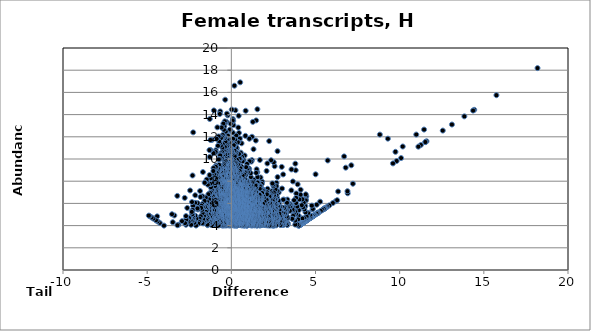
| Category | Series 0 |
|---|---|
| 18.1895096491 | 18.19 |
| 15.7480484156 | 15.748 |
| 14.4288894389 | 14.429 |
| 14.3620040675 | 14.362 |
| 13.8424839201 | 13.842 |
| 12.5608844879 | 12.561 |
| 11.5948890669 | 11.595 |
| 11.5217721789 | 11.522 |
| 11.2599491802 | 11.26 |
| 11.110137439155412 | 11.11 |
| 10.1830408554 | 11.125 |
| 10.0852599896 | 10.085 |
| 9.82118403024 | 9.821 |
| 9.60182648984 | 9.602 |
| 9.3 | 11.831 |
| 8.82317337223 | 12.198 |
| 7.22241447803 | 7.771 |
| 7.12714503846 | 9.434 |
| 6.91288933623 | 6.913 |
| 6.9 | 7.099 |
| 6.7946840774 | 9.219 |
| 6.7 | 10.234 |
| 6.20045727143 | 6.2 |
| 5.72578515184 | 9.868 |
| 13.1051408089 | 13.105 |
| 3.82477850622 | 8.984 |
| 3.07943135834 | 8.61 |
| 2.39657568487 | 7.101 |
| 6.28835856219 | 6.288 |
| 5.57712666131 | 5.577 |
| 4.82387000884 | 5.445 |
| 11.5292597243 | 11.529 |
| 10.987380413 | 12.202 |
| 6.34534475932 | 7.075 |
| 4.52418907845 | 4.524 |
| 11.4498932668 | 12.652 |
| 9.75013065383 | 10.646 |
| 6.03033607837 | 6.03 |
| 5.82273014794 | 5.823 |
| 5.69460165336 | 5.695 |
| 5.61676936629 | 5.617 |
| 5.56529252058 | 5.565 |
| 5.55979769575 | 5.56 |
| 5.53543091487 | 5.535 |
| 5.5131748846 | 5.513 |
| 5.49185309633 | 5.492 |
| 5.40871186103 | 5.409 |
| 5.3165078191 | 5.317 |
| 5.27356507333 | 6.154 |
| 5.18269229752 | 5.183 |
| 5.15299460549 | 5.153 |
| 5.13463167145 | 5.135 |
| 5.12928301694 | 5.129 |
| 5.11561593143 | 5.116 |
| 5.11519974939 | 5.115 |
| 5.10517519227 | 5.105 |
| 5.07242307461 | 5.881 |
| 5.05874941234 | 5.059 |
| 5.00686729419 | 8.623 |
| 4.96670731415 | 4.967 |
| 4.93687346182 | 4.937 |
| 4.93215568443 | 4.932 |
| 4.90640961709 | 4.906 |
| 4.85499301676 | 4.855 |
| 4.85199883711 | 4.852 |
| 4.84291438404 | 5.502 |
| 4.83844759255 | 4.838 |
| 4.78096421984 | 5.8 |
| 4.77452352959 | 4.775 |
| 4.76288029292 | 4.763 |
| 4.76288029292 | 4.763 |
| 4.76288029292 | 4.763 |
| 4.73930807086 | 4.739 |
| 4.72955277045 | 4.73 |
| 4.72137265948 | 4.721 |
| 4.71644223684 | 4.716 |
| 4.71314590249 | 4.713 |
| 4.70984201927 | 4.71 |
| 4.70984201927 | 4.71 |
| 4.70984201927 | 4.71 |
| 4.6999528968 | 4.896 |
| 4.68408354716 | 4.906 |
| 4.65649637055 | 4.656 |
| 4.59514556799 | 4.595 |
| 4.57106999817 | 4.571 |
| 4.5640979808 | 5.149 |
| 4.56240034607 | 5.117 |
| 4.55151601763 | 4.552 |
| 4.5210507369 | 4.521 |
| 4.51790555353 | 4.518 |
| 4.496973581 | 4.497 |
| 4.48864353985 | 4.489 |
| 4.47031993478 | 4.817 |
| 4.45811948117 | 4.458 |
| 4.45493303364 | 6.636 |
| 4.43829285158 | 4.438 |
| 4.43696133783 | 4.437 |
| 4.43362716708 | 4.434 |
| 4.4316303468 | 6.335 |
| 4.42558384815 | 6.259 |
| 4.42102738442 | 6.816 |
| 4.40352287749 | 5.206 |
| 4.39835037035 | 5.761 |
| 4.3840498068 | 4.384 |
| 4.36876834909 | 4.369 |
| 4.36527259976 | 4.365 |
| 4.3645724323 | 4.365 |
| 4.33976638051 | 5.468 |
| 4.33697438893 | 4.661 |
| 4.33270793364 | 4.333 |
| 4.32984117653 | 4.33 |
| 4.31179371775 | 4.312 |
| 4.2982750148 | 6.067 |
| 4.29498826769 | 4.295 |
| 4.28688114779 | 4.287 |
| 4.28392177231 | 4.284 |
| 4.26753579807 | 4.268 |
| 4.26545816008 | 5.655 |
| 4.24564777364 | 4.246 |
| 4.24031432933 | 4.24 |
| 4.23342794375 | 4.233 |
| 4.21800615028 | 4.218 |
| 4.21617922882 | 6.372 |
| 4.21559685983 | 4.646 |
| 4.20711196121 | 4.207 |
| 4.20711196121 | 4.207 |
| 4.19298316997 | 4.193 |
| 4.19219416528 | 4.192 |
| 4.18357009081 | 5.84 |
| 4.18269229752 | 4.183 |
| 4.15866017535 | 4.159 |
| 4.13504228623 | 4.135 |
| 4.1191178349 | 7.229 |
| 4.11686375769 | 4.117 |
| 4.11603199345 | 4.116 |
| 4.11135090598 | 6.779 |
| 4.10097764772 | 4.101 |
| 4.10013667129 | 4.1 |
| 4.09592442 | 4.096 |
| 4.09339115325 | 4.093 |
| 4.08576455378 | 4.086 |
| 4.08491465977 | 4.085 |
| 4.07124781946 | 4.071 |
| 4.06177619759 | 4.062 |
| 4.05745027218 | 4.057 |
| 4.03913839391 | 4.039 |
| 4.03356123265 | 6.359 |
| 4.02236781303 | 4.022 |
| 4.02059109477 | 4.021 |
| 4.00611846138 | 5.381 |
| 4.00090140274 | 4.001 |
| 4.00050084883 | 4.888 |
| 3.99909803371 | 3.999 |
| 3.98447353656 | 4.881 |
| 3.96172343202 | 4.557 |
| 3.94119050751 | 7.719 |
| 3.92056553251 | 4.094 |
| 3.90861734033 | 5.714 |
| 3.85778791065 | 6.892 |
| 3.85115480593 | 6.034 |
| 3.84914530714 | 6.498 |
| 3.84099859264 | 5.039 |
| 3.8029000096 | 9.579 |
| 3.79881318579 | 4.092 |
| 3.7981657506 | 5.295 |
| 3.78457152641 | 4.454 |
| 3.72683908451 | 6.283 |
| 3.71712917851 | 5.03 |
| 3.69434103551 | 5.4 |
| 3.67217047137 | 4.884 |
| 3.66069353935 | 4.592 |
| 3.65733479638 | 7.977 |
| 3.63974928774 | 5.702 |
| 3.63093592515 | 5.441 |
| 3.61211410698 | 4.616 |
| 3.57293936597 | 9.061 |
| 3.56478461878 | 7.175 |
| 3.55579348917 | 5.762 |
| 3.51535703324 | 5.884 |
| 3.48239276708 | 5.723 |
| 3.47410191137 | 5.32 |
| 3.46841418336 | 5.96 |
| 3.40403156387 | 5.872 |
| 3.35962038496 | 4.182 |
| 3.35679670643 | 4.655 |
| 3.35391820913 | 5.616 |
| 3.34794442 | 6.071 |
| 3.34422313458 | 4.713 |
| 3.33197637314 | 6.346 |
| 3.32729460464 | 4.068 |
| 3.32444808687 | 5.955 |
| 3.31478602564 | 4.065 |
| 3.31103977874 | 5.412 |
| 3.30536532135 | 6.06 |
| 3.29633638098 | 4.835 |
| 3.26894244229 | 5.092 |
| 3.26140883378 | 4.216 |
| 3.23169656193 | 5.393 |
| 3.21586437834 | 5.479 |
| 3.19662528885 | 5.091 |
| 3.19296105423 | 4.372 |
| 3.19183495436 | 5.638 |
| 3.17491371117 | 5.352 |
| 3.17434638106 | 5.142 |
| 3.16914663884 | 4.292 |
| 3.1680759848 | 5.073 |
| 3.13410003324 | 4.82 |
| 3.13320338632 | 5.593 |
| 3.13016393256 | 6.342 |
| 3.1270651917 | 4.097 |
| 3.12485982991 | 4.377 |
| 3.1230583964 | 4.341 |
| 3.10832531328 | 4.264 |
| 3.08203576887 | 4.914 |
| 3.08037341646 | 6.335 |
| 3.06873517708 | 4.05 |
| 3.06563097383 | 5.098 |
| 3.06278760516 | 4.305 |
| 3.04778377135 | 4.271 |
| 3.035448836 | 4.128 |
| 3.03129053208 | 5.636 |
| 3.01447849511 | 7.341 |
| 3.00547282231 | 4.685 |
| 2.99516144306 | 4.865 |
| 2.99490784097 | 9.29 |
| 2.994401247 | 4.947 |
| 2.98114097275 | 4.289 |
| 2.97202662055 | 4.884 |
| 2.95772656102 | 4.739 |
| 2.94217934561 | 4.108 |
| 2.94135006635 | 5.475 |
| 2.94032482334 | 4.775 |
| 2.93501065985 | 4.101 |
| 2.93211542177 | 5.229 |
| 2.92803640448 | 4.624 |
| 2.9201629527 | 5.503 |
| 2.91857240066 | 4.049 |
| 2.91030930584 | 5.551 |
| 2.90983187092 | 5.617 |
| 2.90661016116 | 4.815 |
| 2.88505939967 | 4.884 |
| 2.88434802696 | 4.367 |
| 2.8831173577 | 5.539 |
| 2.88086780446 | 5.702 |
| 2.85987852932 | 5.402 |
| 2.84932894718 | 5.068 |
| 2.82635447288 | 6.029 |
| 2.82225078211 | 4.161 |
| 2.8135751205 | 6.982 |
| 2.79444334442 | 6.211 |
| 2.79377651556 | 5.707 |
| 2.79041841605 | 6.24 |
| 2.78788341548 | 4.698 |
| 2.78749953817 | 4.621 |
| 2.77560244277 | 4.568 |
| 2.76517047543 | 5.742 |
| 2.74781109458 | 8.372 |
| 2.74438060834 | 10.704 |
| 2.7401485961 | 7.11 |
| 2.72409098621 | 4.122 |
| 2.7201343402 | 4.537 |
| 2.71678771223 | 4.788 |
| 2.71166970462 | 6.557 |
| 2.70968301653 | 4.754 |
| 2.70242008227 | 4.599 |
| 2.69932581122 | 4.42 |
| 2.69592808818 | 4.268 |
| 2.69295554932 | 5.013 |
| 2.686416652 | 4.575 |
| 2.6835633904 | 7.85 |
| 2.68353099946 | 6.746 |
| 2.68346483338 | 7.554 |
| 2.67963125586 | 5.932 |
| 2.67370909821 | 5.963 |
| 2.67311964635 | 5.462 |
| 2.6716465592 | 4.961 |
| 2.66883505798 | 4.315 |
| 2.66445309438 | 4.424 |
| 2.66361464544 | 5.883 |
| 2.65748498922 | 4.022 |
| 2.65469321411 | 4.449 |
| 2.65213421916 | 6.359 |
| 2.65207669658 | 5.584 |
| 2.64144532091 | 5.281 |
| 2.6370917109 | 5.895 |
| 2.62923813816 | 5.103 |
| 2.62036942256 | 7.027 |
| 2.61967563501 | 5.522 |
| 2.619206162 | 7.254 |
| 2.60873066665 | 4.348 |
| 2.60717723454 | 4.291 |
| 2.60634882536 | 5.269 |
| 2.60366222493 | 6.313 |
| 2.58547237704 | 6.023 |
| 2.58496250072 | 4.849 |
| 2.58250684899 | 5.326 |
| 2.57386242 | 9.349 |
| 2.57346686188 | 6.361 |
| 2.57325700007 | 4.455 |
| 2.56826378857 | 5.838 |
| 2.56159450999 | 6.654 |
| 2.55896729219 | 4.805 |
| 2.54432051622 | 4.091 |
| 2.54055429248 | 6.756 |
| 2.53605290024 | 4 |
| 2.5358745806 | 5.207 |
| 2.53114512748 | 5.451 |
| 2.53090076633 | 5.049 |
| 2.52375494583 | 4.388 |
| 2.52234857057 | 9.708 |
| 2.5220993832 | 6.981 |
| 2.51872880232 | 4.845 |
| 2.5092528409 | 4.38 |
| 2.50238118585 | 7.562 |
| 2.5016206484 | 4.628 |
| 2.49962514337 | 4.367 |
| 2.49765748865 | 7.7 |
| 2.49463822276 | 4.55 |
| 2.49322465734 | 5.647 |
| 2.49240894108 | 4.455 |
| 2.49116593507 | 6.193 |
| 2.48422341125 | 3.995 |
| 2.48224150155 | 5.003 |
| 2.47612096114 | 5.513 |
| 2.47480630375 | 5.787 |
| 2.47072654865 | 6.401 |
| 2.45986440551 | 4.225 |
| 2.45433570826 | 5.226 |
| 2.45069100306 | 6.246 |
| 2.44091026648 | 7.801 |
| 2.43773654754 | 4.018 |
| 2.42617622679 | 4.534 |
| 2.42288095425 | 5.666 |
| 2.4213703871 | 4.655 |
| 2.41956548522 | 5.986 |
| 2.41778113568 | 5.189 |
| 2.41769166546 | 5.154 |
| 2.41596869084 | 4.891 |
| 2.4159042431 | 4.664 |
| 2.41322182204 | 5.317 |
| 2.41160931143 | 5.881 |
| 2.41071157388 | 5.693 |
| 2.39490212644 | 6.891 |
| 2.39001971503 | 5.572 |
| 2.38796277099 | 4.835 |
| 2.38766106035 | 4.577 |
| 2.38551625501 | 4.261 |
| 2.38282093531 | 5.78 |
| 2.37700746261 | 4.594 |
| 2.36406029799 | 9.888 |
| 2.36291236391 | 6.74 |
| 2.36188370274 | 4.082 |
| 2.36110592878 | 4.382 |
| 2.35602129356 | 4.428 |
| 2.3541909637 | 4.027 |
| 2.34775708474 | 4.16 |
| 2.34686331831 | 6.617 |
| 2.33019275073 | 6.048 |
| 2.32875357012 | 5.844 |
| 2.32655825109 | 6.411 |
| 2.32524082893 | 4.316 |
| 2.31962408315 | 4.428 |
| 2.31869583061 | 6.654 |
| 2.31463883439 | 5.461 |
| 2.31395608835 | 5.164 |
| 2.31065002644 | 4.812 |
| 2.30794779339 | 4.776 |
| 2.29988694212 | 5.704 |
| 2.29422045525 | 6.032 |
| 2.29130534278 | 4.567 |
| 2.2907433897 | 4.149 |
| 2.29057959163 | 6.561 |
| 2.28645558449 | 5.256 |
| 2.28575448233 | 4.566 |
| 2.28540221886 | 4.74 |
| 2.28448172177 | 5.53 |
| 2.27877714238 | 4.143 |
| 2.2631213964 | 5.288 |
| 2.26282992776 | 4.005 |
| 2.25856290999 | 4.379 |
| 2.25804834862 | 6.628 |
| 2.25750482777 | 4.479 |
| 2.25607802088 | 5.171 |
| 2.24869082608 | 11.611 |
| 2.2485309748 | 5.137 |
| 2.2464378953 | 4.665 |
| 2.2373427628 | 5.327 |
| 2.23067903252 | 4.335 |
| 2.22808430766 | 4.847 |
| 2.22395589485 | 4.852 |
| 2.22226550732 | 5.492 |
| 2.21949910512 | 5.504 |
| 2.21222897641 | 5.487 |
| 2.20952679457 | 4.851 |
| 2.20929676372 | 4.755 |
| 2.19149482062 | 5.339 |
| 2.16857731798 | 4.219 |
| 2.16264447683 | 5.602 |
| 2.16223806369 | 5.626 |
| 2.16047953729 | 6.106 |
| 2.15805566657 | 5.901 |
| 2.1580155326 | 6.142 |
| 2.15699969938 | 7.318 |
| 2.14347145982 | 4.021 |
| 2.13996062648 | 9.6 |
| 2.13783116698 | 6.417 |
| 2.13540911974 | 4.606 |
| 2.13488907258 | 4.628 |
| 2.13481220669 | 5.534 |
| 2.13144396583 | 6.06 |
| 2.1217884804 | 6.351 |
| 2.11425717926 | 5.24 |
| 2.11047369837 | 7.011 |
| 2.10986300414 | 6.817 |
| 2.10839974787 | 4.685 |
| 2.10345604292 | 4.102 |
| 2.10061999907 | 5.592 |
| 2.09779681995 | 6.311 |
| 2.09392542083 | 8.922 |
| 2.0897818819 | 5.433 |
| 2.08274043101 | 5.694 |
| 2.08203576887 | 5.731 |
| 2.08029993142 | 5.104 |
| 2.07850197368 | 4.512 |
| 2.07663845971 | 4.161 |
| 2.07222832756 | 5.84 |
| 2.06343610821 | 5.188 |
| 2.05974208369 | 5.094 |
| 2.05640792189 | 4.276 |
| 2.0464039599 | 4.336 |
| 2.04106265662 | 5.247 |
| 2.03963303625 | 5.213 |
| 2.03372061784 | 5.89 |
| 2.02574541284 | 5.155 |
| 2.0218343706 | 4.721 |
| 2.02160225449 | 5.99 |
| 2.02069899267 | 4.044 |
| 2.0168187384 | 4.695 |
| 2.01581175258 | 5.287 |
| 2.0071955014 | 4.051 |
| 2.00203244228 | 4.68 |
| 1.99829165754 | 5.365 |
| 1.98568540307 | 5.095 |
| 1.97800903608 | 4.908 |
| 1.97695401459 | 5.216 |
| 1.97198562383 | 6.076 |
| 1.97133296829 | 6.161 |
| 1.96680030688 | 5.62 |
| 1.96400574114 | 4.515 |
| 1.96232958203 | 5.011 |
| 1.95751666868 | 4.992 |
| 1.95479029724 | 4.454 |
| 1.94958837435 | 5.515 |
| 1.94827280333 | 4.325 |
| 1.94329289503 | 4.435 |
| 1.93688995615 | 4.574 |
| 1.93614953746 | 4.232 |
| 1.93548203931 | 4.279 |
| 1.93358047369 | 6.522 |
| 1.92518051969 | 4.07 |
| 1.92114457929 | 4.426 |
| 1.9158915704 | 4.485 |
| 1.90698216332 | 7.216 |
| 1.901768163 | 4.146 |
| 1.89939084267 | 7.174 |
| 1.89500685211 | 4.713 |
| 1.88911031972 | 5.024 |
| 1.88623925517 | 4.348 |
| 1.88461739484 | 5.45 |
| 1.8840807127 | 5.22 |
| 1.87997172537 | 5.965 |
| 1.87943537081 | 4.708 |
| 1.87581022426 | 4.109 |
| 1.87560175392 | 6.743 |
| 1.87190523766 | 5.121 |
| 1.86782244357 | 4.575 |
| 1.86480226098 | 4.216 |
| 1.86236386951 | 5.628 |
| 1.85473289985 | 5.643 |
| 1.85014443251 | 7.18 |
| 1.84283908645 | 6.92 |
| 1.84249393088 | 4.093 |
| 1.84112658335 | 4.659 |
| 1.83953532781 | 6.455 |
| 1.83889911481 | 5.534 |
| 1.83806778931 | 4.132 |
| 1.8308581347 | 6.934 |
| 1.83052898903 | 7.953 |
| 1.82623708988 | 4.933 |
| 1.82208018427 | 5.63 |
| 1.81991838352 | 4.067 |
| 1.81776960988 | 5.079 |
| 1.81440554229 | 4.997 |
| 1.81438390084 | 4.332 |
| 1.81392757598 | 4.841 |
| 1.81217165371 | 7.76 |
| 1.81206704941 | 4.501 |
| 1.80753554116 | 5.654 |
| 1.8050681962 | 4.268 |
| 1.79093934207 | 5.366 |
| 1.78700627667 | 4.101 |
| 1.77377388089 | 7.395 |
| 1.76544906546 | 6.429 |
| 1.76297159998 | 6.698 |
| 1.7544836687 | 5.076 |
| 1.74942689785 | 6.5 |
| 1.74644664718 | 4.51 |
| 1.7442634664 | 4.725 |
| 1.74374807938 | 6.292 |
| 1.74222611063 | 4.784 |
| 1.73328635334 | 8.337 |
| 1.7324114234 | 7.578 |
| 1.73194568144 | 4.501 |
| 1.7301764285 | 4.733 |
| 1.72724199039 | 5.278 |
| 1.7257411565 | 4.021 |
| 1.725618871 | 5.783 |
| 1.72370669679 | 4.716 |
| 1.72333625374 | 5.244 |
| 1.72300900342 | 5.766 |
| 1.72169883751 | 5.657 |
| 1.72039912578 | 4.988 |
| 1.71749977158 | 5.187 |
| 1.71049338281 | 5.037 |
| 1.70837099178 | 5.237 |
| 1.70565420759 | 6.786 |
| 1.70303719637 | 6.518 |
| 1.70209513432 | 6.192 |
| 1.70068147684 | 5.846 |
| 1.69634386499 | 4.023 |
| 1.69570321177 | 9.911 |
| 1.69496177872 | 5.969 |
| 1.69377739195 | 7.531 |
| 1.69135184531 | 4.577 |
| 1.68994896766 | 4.328 |
| 1.68915238558 | 7.322 |
| 1.68906093026 | 6.255 |
| 1.68825378571 | 4.339 |
| 1.68669858881 | 6.367 |
| 1.68481142909 | 4.637 |
| 1.68474862042 | 5.398 |
| 1.68265284165 | 6.231 |
| 1.67855530101 | 4.923 |
| 1.67753668157 | 5.797 |
| 1.67523841534 | 6.762 |
| 1.67316077983 | 4.064 |
| 1.67117512364 | 4.919 |
| 1.66842522301 | 4.807 |
| 1.66806200888 | 4.191 |
| 1.66074155771 | 4.535 |
| 1.65585211206 | 6.464 |
| 1.65551578055 | 5.078 |
| 1.65380538864 | 5.713 |
| 1.6534879521 | 4.029 |
| 1.65119619912 | 5.399 |
| 1.64994702417 | 5.063 |
| 1.64760843428 | 5.794 |
| 1.6469782457 | 6.19 |
| 1.63372832772 | 5.154 |
| 1.62836928824 | 6.343 |
| 1.61705800284 | 5.947 |
| 1.6163096338 | 4.566 |
| 1.61526110125 | 4.372 |
| 1.61223543087 | 4.341 |
| 1.61048629852 | 4.872 |
| 1.61022541189 | 4.052 |
| 1.60868541151 | 5.928 |
| 1.6042706047 | 6.247 |
| 1.60275181416 | 6.002 |
| 1.59828889247 | 7.867 |
| 1.59511296132 | 5.132 |
| 1.59265853434 | 5.944 |
| 1.59002637058 | 5.21 |
| 1.59000513095 | 4.177 |
| 1.58993731614 | 4.474 |
| 1.58370961741 | 5.493 |
| 1.58299831384 | 4.216 |
| 1.580623565 | 4.677 |
| 1.57548522242 | 4.412 |
| 1.57531233069 | 5.35 |
| 1.57092336009 | 4.642 |
| 1.56471281612 | 6.049 |
| 1.56117624786 | 5.95 |
| 1.56104387381 | 4.668 |
| 1.55937078682 | 4.084 |
| 1.55890527946 | 5.246 |
| 1.55809724707 | 5.693 |
| 1.5546470965 | 8.371 |
| 1.55424936549 | 4.58 |
| 1.55191253465 | 6.06 |
| 1.55066815856 | 5.775 |
| 1.54896589247 | 7.882 |
| 1.54717796251 | 14.483 |
| 1.54468850374 | 6.439 |
| 1.54423049014 | 8.805 |
| 1.54195350168 | 5.216 |
| 1.53997504595 | 4.508 |
| 1.53995849125 | 5.499 |
| 1.53605290024 | 5.375 |
| 1.53153846576 | 4.472 |
| 1.52904039615 | 6.464 |
| 1.52664354151 | 4.165 |
| 1.52484150828 | 4.009 |
| 1.52227543079 | 5.044 |
| 1.51925034918 | 5.683 |
| 1.51905047924 | 5.132 |
| 1.51381098471 | 6.241 |
| 1.51068431048 | 5.233 |
| 1.50948843515 | 4.778 |
| 1.50918967177 | 4.004 |
| 1.50809883867 | 4.09 |
| 1.50528580304 | 5.185 |
| 1.50500801315 | 5.341 |
| 1.50391878037 | 4.455 |
| 1.50353670625 | 6.021 |
| 1.50321919774 | 9.07 |
| 1.5020361636 | 6.602 |
| 1.50139778408 | 4.833 |
| 1.49776144884 | 5.423 |
| 1.49629811444 | 6.238 |
| 1.49525969777 | 4.969 |
| 1.49325875593 | 7.674 |
| 1.4894441877 | 4.606 |
| 1.48872326331 | 7.033 |
| 1.48871773098 | 5.388 |
| 1.48723664231 | 7.481 |
| 1.48542682717 | 5.18 |
| 1.48373093531 | 5.826 |
| 1.48330417592 | 4.401 |
| 1.48263665095 | 5.456 |
| 1.48219373109 | 6.035 |
| 1.48181707956 | 5.674 |
| 1.48082005704 | 7.103 |
| 1.47684038733 | 6.771 |
| 1.47676516295 | 6.318 |
| 1.4756837452 | 8.751 |
| 1.47482658844 | 13.479 |
| 1.47313812523 | 5.228 |
| 1.4718723407 | 5.99 |
| 1.47088163938 | 5.204 |
| 1.4694254331 | 6.968 |
| 1.46642741949 | 6.618 |
| 1.46332639423 | 7.643 |
| 1.46133696113 | 5.587 |
| 1.45988932646 | 7.417 |
| 1.45630551765 | 6.444 |
| 1.45462612767 | 6.162 |
| 1.4542203255 | 7.044 |
| 1.45350109533 | 11.664 |
| 1.45335119611 | 4.323 |
| 1.45222081329 | 4.955 |
| 1.44599920245 | 4.892 |
| 1.44557277008 | 6.265 |
| 1.44387997479 | 5.191 |
| 1.44249903906 | 4.664 |
| 1.4424188868 | 4.886 |
| 1.44151340512 | 6.021 |
| 1.43977644599 | 4.063 |
| 1.43655606153 | 4.274 |
| 1.4355177677 | 7.621 |
| 1.43368456187 | 5.318 |
| 1.43046036795 | 4.23 |
| 1.43012491391 | 4.957 |
| 1.42765049589 | 4.076 |
| 1.42331373864 | 4.667 |
| 1.42307196129 | 5.238 |
| 1.41547514377 | 5.47 |
| 1.4154032478 | 4.094 |
| 1.41361120649 | 5.771 |
| 1.40103982385 | 4.039 |
| 1.39894181309 | 4.124 |
| 1.3932050834 | 7.234 |
| 1.39131311014 | 5.075 |
| 1.389912468 | 5.299 |
| 1.38389625509 | 6.266 |
| 1.38070750654 | 4.614 |
| 1.37885457317 | 6.698 |
| 1.37736708131 | 4.04 |
| 1.37618657031 | 4.415 |
| 1.37401660604 | 4.213 |
| 1.37270469122 | 6.181 |
| 1.37163071176 | 4.036 |
| 1.36769007143 | 6.522 |
| 1.36713098143 | 5.566 |
| 1.36650892727 | 5.23 |
| 1.36598070755 | 4.869 |
| 1.36506209562 | 6.662 |
| 1.35946015138 | 5.76 |
| 1.3586866449 | 4.543 |
| 1.35810672451 | 5.39 |
| 1.35791224309 | 4.922 |
| 1.35771565898 | 6.507 |
| 1.35592202474 | 6.931 |
| 1.35499284562 | 5.327 |
| 1.35301438546 | 7.153 |
| 1.35284625526 | 6.691 |
| 1.35045924192 | 6.29 |
| 1.34891945771 | 4.916 |
| 1.34663848579 | 6.348 |
| 1.34471257598 | 6.096 |
| 1.34333765401 | 4.59 |
| 1.34225269655 | 5.503 |
| 1.34096052616 | 4.05 |
| 1.33390961449 | 6.548 |
| 1.33309877536 | 5.809 |
| 1.33297732077 | 6 |
| 1.33189709186 | 5.998 |
| 1.32926260505 | 5.064 |
| 1.32608657637 | 5.045 |
| 1.32473720766 | 8.127 |
| 1.32156296348 | 6.357 |
| 1.31901093623 | 10.88 |
| 1.31672808593 | 6.022 |
| 1.31531959912 | 4.957 |
| 1.31529500255 | 5.48 |
| 1.31495542113 | 6.269 |
| 1.31479281858 | 6.18 |
| 1.31309593378 | 4.842 |
| 1.31108311094 | 4.936 |
| 1.30875270614 | 5.537 |
| 1.30825315799 | 4.4 |
| 1.30776670944 | 7.925 |
| 1.30385117827 | 5.953 |
| 1.30347533186 | 4.912 |
| 1.30256277002 | 6.45 |
| 1.30205107234 | 6.189 |
| 1.30109582441 | 4.832 |
| 1.30103287058 | 6.853 |
| 1.29829798712 | 6.649 |
| 1.29454821857 | 7.164 |
| 1.29301211234 | 6.771 |
| 1.28182737146 | 6.264 |
| 1.28177096842 | 4.658 |
| 1.28097244694 | 5.629 |
| 1.28034583718 | 5.157 |
| 1.27991940307 | 6.251 |
| 1.27847788669 | 13.345 |
| 1.2751654853 | 4.292 |
| 1.27452522566 | 4.271 |
| 1.27273090444 | 4.064 |
| 1.27018451979 | 4.596 |
| 1.26574369309 | 4.436 |
| 1.2639706129 | 7.44 |
| 1.26261139013 | 5.235 |
| 1.2625806568 | 5.461 |
| 1.26225478137 | 5.355 |
| 1.26053361361 | 6.114 |
| 1.25933992228 | 5.278 |
| 1.25926291843 | 5.288 |
| 1.25869547011 | 6.807 |
| 1.25767705847 | 4.4 |
| 1.25750084015 | 5.642 |
| 1.25407531423 | 5.983 |
| 1.25248448649 | 4.904 |
| 1.25038028591 | 4.873 |
| 1.24653850867 | 4.522 |
| 1.24626382496 | 5.993 |
| 1.24597601118 | 7.338 |
| 1.2457564144 | 4.833 |
| 1.24462236872 | 4.005 |
| 1.24370865257 | 4.578 |
| 1.24225666971 | 6.051 |
| 1.24070731872 | 6.199 |
| 1.24014469031 | 5.472 |
| 1.23947967785 | 5.34 |
| 1.23937798962 | 4.206 |
| 1.23709323588 | 4.709 |
| 1.23639927933 | 5.559 |
| 1.23385484743 | 5.869 |
| 1.23337920487 | 6.111 |
| 1.23323980357 | 4.067 |
| 1.23285963491 | 6.259 |
| 1.23180645174 | 6.662 |
| 1.23134907438 | 7.239 |
| 1.22698004207 | 12.004 |
| 1.22460468154 | 6.073 |
| 1.22457958261 | 6.277 |
| 1.22378196639 | 5.269 |
| 1.22308040182 | 5.881 |
| 1.22275497129 | 6.551 |
| 1.22225187628 | 6.596 |
| 1.2217143038 | 4.268 |
| 1.22066851369 | 9.9 |
| 1.22024908762 | 7.883 |
| 1.21938652093 | 4.593 |
| 1.21898581989 | 5.369 |
| 1.21838493253 | 4.29 |
| 1.2182704327 | 4.48 |
| 1.21820583964 | 6.013 |
| 1.21749068469 | 4.512 |
| 1.2167148515 | 5.672 |
| 1.21620058762 | 4.909 |
| 1.21434195669 | 5.598 |
| 1.21410731295 | 5.53 |
| 1.21272932399 | 4.343 |
| 1.21258419725 | 6.738 |
| 1.20950729513 | 5.552 |
| 1.20826372054 | 5.331 |
| 1.207513245 | 5.355 |
| 1.20503885459 | 5.903 |
| 1.20447051334 | 4.96 |
| 1.19918503018 | 4.137 |
| 1.1974325464 | 5.317 |
| 1.19568913221 | 7.07 |
| 1.19247901233 | 4.074 |
| 1.18693688355 | 5.463 |
| 1.18668762265 | 4.313 |
| 1.18619387261 | 5.769 |
| 1.18503189383 | 4.376 |
| 1.18502486921 | 9.766 |
| 1.18433065791 | 5.294 |
| 1.18397114891 | 6.629 |
| 1.18269229752 | 4.452 |
| 1.18161651615 | 7.282 |
| 1.18009540047 | 4.039 |
| 1.17785310525 | 5.137 |
| 1.17737832129 | 6.422 |
| 1.17578321206 | 4.469 |
| 1.17355999114 | 4.999 |
| 1.17297330763 | 7.103 |
| 1.17230372423 | 6.283 |
| 1.17106837714 | 4.95 |
| 1.16686649904 | 5.646 |
| 1.16639148942 | 4.755 |
| 1.16548821156 | 5.963 |
| 1.1643868179 | 5.037 |
| 1.16401561115 | 5.239 |
| 1.16329425421 | 5.912 |
| 1.16317395945 | 4.468 |
| 1.16112816449 | 7.145 |
| 1.16082929093 | 4.874 |
| 1.16041683717 | 8.379 |
| 1.15979660316 | 5.084 |
| 1.15843803392 | 5.393 |
| 1.15830461056 | 7.214 |
| 1.1563180709 | 4.323 |
| 1.15559040165 | 6.109 |
| 1.1547042645 | 5.394 |
| 1.1544339197 | 4.18 |
| 1.15408348496 | 5.334 |
| 1.15111395527 | 5.044 |
| 1.14968066844 | 8.722 |
| 1.14865344012 | 4.03 |
| 1.14790627805 | 6.541 |
| 1.14748761232 | 4.131 |
| 1.14319555401 | 7.626 |
| 1.14088018489 | 5.905 |
| 1.14060895016 | 6.528 |
| 1.13909059261 | 6.386 |
| 1.13621149368 | 4.819 |
| 1.13543662506 | 4.976 |
| 1.13048978827 | 5.906 |
| 1.12751030113 | 4.408 |
| 1.12701114993 | 4.39 |
| 1.12655322419 | 5.03 |
| 1.1216963403 | 5.205 |
| 1.12038295762 | 6.676 |
| 1.11858370153 | 5.271 |
| 1.11626129083 | 4.082 |
| 1.11491605399 | 4.922 |
| 1.11431102623 | 4.864 |
| 1.11414858268 | 6.915 |
| 1.11399677087 | 4.348 |
| 1.11161199062 | 4.811 |
| 1.11105641387 | 6.642 |
| 1.1105457344 | 5.861 |
| 1.1104494271 | 4.159 |
| 1.11008089083 | 7.132 |
| 1.10869378777 | 7.039 |
| 1.10722820048 | 4.642 |
| 1.10603279707 | 6.322 |
| 1.10564620806 | 5.175 |
| 1.10271166832 | 4.681 |
| 1.10150612008 | 4.734 |
| 1.1008826106 | 7.038 |
| 1.10053893857 | 4.094 |
| 1.10023626603 | 5.666 |
| 1.10022744774 | 4.887 |
| 1.09974915314 | 4.772 |
| 1.09970454807 | 6.142 |
| 1.09965324782 | 4.627 |
| 1.09943169178 | 4.811 |
| 1.09531396822 | 6.184 |
| 1.09391295111 | 4.197 |
| 1.09262050183 | 5.192 |
| 1.09136877071 | 4.818 |
| 1.09066661873 | 4.889 |
| 1.09060254878 | 4.703 |
| 1.08583616948 | 4.982 |
| 1.08457340499 | 4.117 |
| 1.08320030042 | 5.905 |
| 1.0821623171 | 6.435 |
| 1.0819834088 | 6.797 |
| 1.08191829392 | 7.88 |
| 1.08187334436 | 9.794 |
| 1.0785362011 | 6.718 |
| 1.07847938869 | 4.571 |
| 1.07667905989 | 5.715 |
| 1.07541511082 | 5.724 |
| 1.07394999518 | 4.402 |
| 1.0721863301 | 11.825 |
| 1.07120042805 | 6.587 |
| 1.06947168021 | 5.349 |
| 1.06823843002 | 6.343 |
| 1.06667876387 | 5.182 |
| 1.06518973451 | 9.093 |
| 1.06501979185 | 6.355 |
| 1.06501979185 | 5.908 |
| 1.06480829563 | 4.787 |
| 1.06474826821 | 6.996 |
| 1.06378891675 | 7.451 |
| 1.06141048383 | 6.529 |
| 1.06125108647 | 5.778 |
| 1.06101634031 | 5.892 |
| 1.06021463684 | 5.57 |
| 1.06004278911 | 4.474 |
| 1.05977222052 | 4.107 |
| 1.05938852529 | 4.086 |
| 1.05804728537 | 5.956 |
| 1.05730743816 | 6.796 |
| 1.05586387686 | 6.71 |
| 1.05489824615 | 6.496 |
| 1.05259495095 | 4.14 |
| 1.05213073287 | 5.449 |
| 1.05016678669 | 6.301 |
| 1.04961503504 | 7.665 |
| 1.04830386441 | 4.995 |
| 1.04472255376 | 6.403 |
| 1.04287296032 | 5.396 |
| 1.04125905132 | 6.989 |
| 1.04030972454 | 6.937 |
| 1.04023132296 | 5.182 |
| 1.03982942743 | 5.962 |
| 1.03944014484 | 4.701 |
| 1.03691340008 | 4.532 |
| 1.03650486983 | 5.683 |
| 1.03628091549 | 4.085 |
| 1.0320561922 | 5.558 |
| 1.03168589986 | 5.94 |
| 1.03135495897 | 5.651 |
| 1.03131259801 | 9.158 |
| 1.03024628687 | 5.266 |
| 1.02957311538 | 4.626 |
| 1.02834462569 | 4.458 |
| 1.02244106301 | 4.119 |
| 1.02240868779 | 4.996 |
| 1.02165165762 | 5.462 |
| 1.02164083139 | 5.558 |
| 1.02044262286 | 5.815 |
| 1.01989415033 | 7.784 |
| 1.01635958044 | 5.372 |
| 1.01389444166 | 4.989 |
| 1.01352959313 | 4.525 |
| 1.01179000057 | 4.732 |
| 1.01136199229 | 5.287 |
| 1.01087008522 | 4.082 |
| 1.00966124847 | 7.285 |
| 1.00956820278 | 7.001 |
| 1.00667346431 | 5.923 |
| 1.00279883444 | 7.699 |
| 0.997913672752 | 5.339 |
| 0.997016141561 | 6.426 |
| 0.993331869749 | 6.489 |
| 0.992885475043 | 7.883 |
| 0.992418251855 | 6.301 |
| 0.991592217025 | 5.796 |
| 0.991386869695 | 4.734 |
| 0.988568658116 | 4.961 |
| 0.986998755141 | 5.611 |
| 0.9855251925 | 6.112 |
| 0.985115762914 | 4.272 |
| 0.984339655828 | 5.431 |
| 0.983231420952 | 5.695 |
| 0.981970250831 | 4.97 |
| 0.981938003891 | 8.817 |
| 0.981452700866 | 4.982 |
| 0.980800941705 | 6.103 |
| 0.980060051706 | 7.265 |
| 0.98002960937 | 6.223 |
| 0.978040747424 | 4.832 |
| 0.97553426158 | 5.4 |
| 0.974066413062 | 6.223 |
| 0.973188872475 | 5.138 |
| 0.972478676682 | 7.919 |
| 0.97208725428 | 4.569 |
| 0.971075314461 | 5.401 |
| 0.969670389939 | 5.331 |
| 0.966817567049 | 5.97 |
| 0.965933274272 | 4.845 |
| 0.965625108719 | 6.439 |
| 0.965194955525 | 6.279 |
| 0.964362551401 | 5.26 |
| 0.963181666029 | 4.85 |
| 0.963065822132 | 6.355 |
| 0.96305249906 | 6.354 |
| 0.962236772883 | 4.812 |
| 0.957265922788 | 4.894 |
| 0.95515904273 | 6.641 |
| 0.954658678967 | 7.012 |
| 0.953815714087 | 5.908 |
| 0.953566881291 | 9.139 |
| 0.952795240055 | 5.356 |
| 0.952504344462 | 5.176 |
| 0.952105309896 | 4.795 |
| 0.948351935546 | 7.282 |
| 0.947644594939 | 4.752 |
| 0.94704228442 | 4.415 |
| 0.946116219377 | 6.555 |
| 0.943777025211 | 7.123 |
| 0.942979225065 | 5.619 |
| 0.942597688955 | 4.568 |
| 0.942030819175 | 5.538 |
| 0.938970566602 | 4.564 |
| 0.938385357978 | 4.008 |
| 0.937211046951 | 4.664 |
| 0.935712620874 | 4.878 |
| 0.929646723781 | 9.56 |
| 0.928582256924 | 6.177 |
| 0.928402480453 | 4.958 |
| 0.927874591093 | 8.04 |
| 0.92618415446 | 4.513 |
| 0.925037942319 | 5.485 |
| 0.924610971995 | 4.406 |
| 0.923794154264 | 7.963 |
| 0.921577194672 | 4.876 |
| 0.921144579289 | 5.455 |
| 0.921123151428 | 5.419 |
| 0.921023377513 | 4.905 |
| 0.92068118151 | 7.217 |
| 0.920543597882 | 5.125 |
| 0.91955016758 | 4.005 |
| 0.918646752269 | 5.278 |
| 0.917806373088 | 6.987 |
| 0.916971021201 | 6.092 |
| 0.911644125579 | 4.276 |
| 0.911360569009 | 5.79 |
| 0.909947187422 | 6.439 |
| 0.908815170437 | 4.55 |
| 0.907929377634 | 4.521 |
| 0.907703152679 | 4.279 |
| 0.907299812755 | 4.702 |
| 0.906994569883 | 5.706 |
| 0.906860302481 | 6.496 |
| 0.905528001527 | 5.379 |
| 0.903949841638 | 4.366 |
| 0.903715506139 | 6.155 |
| 0.903196371236 | 7.347 |
| 0.90209758442 | 5.496 |
| 0.900834295688 | 4.951 |
| 0.90037728865 | 3.997 |
| 0.900078802452 | 6.087 |
| 0.899731559969 | 4.099 |
| 0.898081675138 | 4.646 |
| 0.89696316886 | 4.7 |
| 0.892919396824 | 5.223 |
| 0.892617844034 | 6.064 |
| 0.890730505597 | 6.08 |
| 0.888391883083 | 6.977 |
| 0.88497581918 | 5.044 |
| 0.88446026194 | 5.748 |
| 0.882972349738 | 7.61 |
| 0.882222199983 | 4.845 |
| 0.880490259172 | 5.096 |
| 0.880336492039 | 5.598 |
| 0.87939954055 | 6.33 |
| 0.879376582478 | 5.205 |
| 0.879078273862 | 7.509 |
| 0.87739069155 | 5.004 |
| 0.87693408655 | 9.263 |
| 0.876868112509 | 4.572 |
| 0.873989874097 | 6.749 |
| 0.872929832584 | 4.195 |
| 0.872286758713 | 5.119 |
| 0.872048846396 | 5.678 |
| 0.871430685736 | 4.474 |
| 0.871071933245 | 4.594 |
| 0.870709112185 | 6.322 |
| 0.870337971555 | 5.677 |
| 0.870112829026 | 6.997 |
| 0.869241592015 | 6.188 |
| 0.868830097886 | 6.687 |
| 0.867020008104 | 5.487 |
| 0.866548658294 | 6.398 |
| 0.866389401106 | 6.778 |
| 0.866263737585 | 4.896 |
| 0.865730494733 | 6.544 |
| 0.862519554755 | 8.779 |
| 0.862146507774 | 6.328 |
| 0.861521352833 | 4.455 |
| 0.86095883151 | 4.333 |
| 0.860484472026 | 5.822 |
| 0.859728272572 | 4.055 |
| 0.859548135503 | 5.259 |
| 0.858331727183 | 6.062 |
| 0.857575883367 | 5.209 |
| 0.857509372031 | 6.554 |
| 0.857063362417 | 4.234 |
| 0.855903458509 | 5.743 |
| 0.854660636836 | 5.631 |
| 0.852122402477 | 14.345 |
| 0.851093294463 | 6.13 |
| 0.850577097658 | 4.546 |
| 0.850490803495 | 7.541 |
| 0.850437856644 | 4.518 |
| 0.850226729319 | 5.139 |
| 0.850130873908 | 6.051 |
| 0.849321087502 | 5.31 |
| 0.847792581798 | 8.541 |
| 0.847024531563 | 5.637 |
| 0.846632840095 | 4.461 |
| 0.844430291535 | 4.159 |
| 0.84232913898 | 5.723 |
| 0.842011618325 | 5.767 |
| 0.841916611202 | 4.451 |
| 0.841214519773 | 6.204 |
| 0.841042144895 | 6.417 |
| 0.840755814023 | 6.956 |
| 0.838759123327 | 7.952 |
| 0.83875475425 | 5.57 |
| 0.838544219326 | 5.072 |
| 0.838099988759 | 7.803 |
| 0.837436261295 | 5.061 |
| 0.836825266972 | 5.744 |
| 0.836758486101 | 4.15 |
| 0.836548317746 | 7.084 |
| 0.835144529514 | 12.086 |
| 0.833870946869 | 6.483 |
| 0.831548466536 | 7.458 |
| 0.830631486526 | 5.304 |
| 0.83049379454 | 6.018 |
| 0.829252602668 | 7.456 |
| 0.827434263964 | 4.965 |
| 0.826869195733 | 5.867 |
| 0.826772375885 | 6.338 |
| 0.825667034723 | 7.031 |
| 0.825608929208 | 5.561 |
| 0.824394007252 | 4.718 |
| 0.823204445104 | 6.384 |
| 0.822640708991 | 6.644 |
| 0.822316426711 | 5.537 |
| 0.822171532747 | 5.539 |
| 0.821449751943 | 4.227 |
| 0.820389651724 | 7.558 |
| 0.820252759445 | 7.249 |
| 0.820164978544 | 4.6 |
| 0.819215241137 | 6.328 |
| 0.818532883768 | 5.905 |
| 0.817790018684 | 6.836 |
| 0.816783210466 | 6.347 |
| 0.816294053915 | 6.337 |
| 0.815963931415 | 8.204 |
| 0.814796305627 | 4.548 |
| 0.814666677034 | 7.123 |
| 0.812193478994 | 6.186 |
| 0.81181837643 | 6.183 |
| 0.811238356545 | 4.281 |
| 0.810801894216 | 5.326 |
| 0.810445117034 | 6.973 |
| 0.809319690454 | 6.03 |
| 0.807886464602 | 4.954 |
| 0.807128670188 | 5.618 |
| 0.80684426367 | 6.035 |
| 0.805731179578 | 4.751 |
| 0.805467812513 | 4.323 |
| 0.80311624125 | 6.283 |
| 0.80246276735 | 4.033 |
| 0.801773889794 | 4.11 |
| 0.801375307079 | 6.608 |
| 0.799979333315 | 5.657 |
| 0.798424652957 | 7.067 |
| 0.797439453193 | 5.554 |
| 0.797392048185 | 7.268 |
| 0.797353619711 | 6.758 |
| 0.796789120607 | 7.584 |
| 0.796387595261 | 5.473 |
| 0.796257213174 | 4.785 |
| 0.795550400541 | 8.787 |
| 0.795416064635 | 8.171 |
| 0.795350400799 | 5.857 |
| 0.795251704756 | 4.146 |
| 0.795192083953 | 7.809 |
| 0.794459796521 | 5.798 |
| 0.794298769232 | 4.105 |
| 0.791269119504 | 5.571 |
| 0.790875438767 | 5.187 |
| 0.79081362967 | 5.419 |
| 0.790226554776 | 10.315 |
| 0.789881615518 | 5.84 |
| 0.789359719421 | 4.184 |
| 0.788967022859 | 4.896 |
| 0.788495894806 | 5.304 |
| 0.787393022289 | 4.86 |
| 0.78708733378 | 4.396 |
| 0.78565010766 | 4.041 |
| 0.78510795969 | 5.08 |
| 0.784762174116 | 6.207 |
| 0.784300268548 | 7.025 |
| 0.78365395473 | 4.287 |
| 0.783363975491 | 4.1 |
| 0.783361050202 | 5.844 |
| 0.78307554009 | 6.608 |
| 0.782877265894 | 4.715 |
| 0.781805530338 | 5.781 |
| 0.780618269261 | 5.874 |
| 0.780523587824 | 4.08 |
| 0.779217484532 | 6.042 |
| 0.779040640463 | 5.919 |
| 0.77685832129 | 4.037 |
| 0.775791061851 | 5.773 |
| 0.775552433179 | 6.583 |
| 0.775518834936 | 5.25 |
| 0.774787059601 | 4.031 |
| 0.773547605093 | 4.314 |
| 0.771978640423 | 4.269 |
| 0.771855435732 | 5.595 |
| 0.771787905419 | 5.257 |
| 0.771003230354 | 7.106 |
| 0.770890117583 | 5.278 |
| 0.767584393365 | 4.078 |
| 0.767323396297 | 4.895 |
| 0.766444221086 | 8.615 |
| 0.766150318143 | 5.449 |
| 0.765944661138 | 5.624 |
| 0.765861739801 | 4.756 |
| 0.765534746363 | 4.14 |
| 0.765202557773 | 4.733 |
| 0.764828546809 | 6.324 |
| 0.764194847598 | 7.121 |
| 0.76404274741 | 7.392 |
| 0.762416836327 | 7.955 |
| 0.762339006558 | 5.209 |
| 0.761335422799 | 7.015 |
| 0.760822824215 | 5.901 |
| 0.760769567424 | 5.873 |
| 0.760355414442 | 4.098 |
| 0.759803183989 | 6.662 |
| 0.758373533203 | 7.312 |
| 0.757596393418 | 6.452 |
| 0.75697699055 | 7.797 |
| 0.755426042257 | 7.73 |
| 0.753472582495 | 5.513 |
| 0.753446029121 | 6.082 |
| 0.752516597701 | 5.413 |
| 0.752439897361 | 6.403 |
| 0.751974260511 | 5.921 |
| 0.75183094373 | 4.861 |
| 0.749630995103 | 4.687 |
| 0.749625815175 | 7.903 |
| 0.748823082778 | 4.884 |
| 0.748807551488 | 5.91 |
| 0.748750949862 | 6.51 |
| 0.747584117769 | 7.104 |
| 0.745097552744 | 7.491 |
| 0.744113908323 | 5.155 |
| 0.743065793703 | 4.933 |
| 0.741955269145 | 3.997 |
| 0.741659197463 | 5.262 |
| 0.741583358919 | 6.746 |
| 0.740995471202 | 4.454 |
| 0.74068811512 | 5.094 |
| 0.740577323541 | 5.303 |
| 0.74054483773 | 7.785 |
| 0.738762225832 | 4.626 |
| 0.738521455369 | 7.973 |
| 0.738396332441 | 5.196 |
| 0.736965594166 | 5.783 |
| 0.733585751692 | 5.236 |
| 0.731565847033 | 5.281 |
| 0.729967868041 | 4.231 |
| 0.729169564767 | 6.302 |
| 0.727857001743 | 4.446 |
| 0.727525270544 | 7.051 |
| 0.727470513323 | 6.693 |
| 0.727392705551 | 4.478 |
| 0.726703254712 | 6.635 |
| 0.726111497139 | 5.78 |
| 0.725969057395 | 9.893 |
| 0.725590394771 | 6.61 |
| 0.725337876773 | 4.91 |
| 0.722897387919 | 6.58 |
| 0.72273723324 | 5.523 |
| 0.722024360595 | 4.657 |
| 0.720582200429 | 4.737 |
| 0.719043686169 | 4.961 |
| 0.717342292406 | 6.228 |
| 0.716504282386 | 5.249 |
| 0.714838777279 | 6.966 |
| 0.714459179229 | 6.17 |
| 0.713867766399 | 5.4 |
| 0.713854071608 | 4.054 |
| 0.713643761117 | 7.471 |
| 0.71332509184 | 6.112 |
| 0.713110280023 | 7.047 |
| 0.712841664758 | 5.678 |
| 0.711484812262 | 7.423 |
| 0.706199644395 | 4.063 |
| 0.705085629582 | 4.3 |
| 0.705029072289 | 4.069 |
| 0.701664389533 | 5.466 |
| 0.700753709271 | 5.504 |
| 0.700345105881 | 6.514 |
| 0.699421225306 | 6.017 |
| 0.698941505883 | 6.108 |
| 0.698898291958 | 6.763 |
| 0.69877454736 | 6.033 |
| 0.698595075209 | 4.935 |
| 0.69797146255 | 6.599 |
| 0.69772426411 | 6.512 |
| 0.696966216865 | 6.1 |
| 0.696176011833 | 5.918 |
| 0.695913217873 | 4.47 |
| 0.695145418472 | 4.667 |
| 0.694381396273 | 7.365 |
| 0.693629186024 | 4.896 |
| 0.691808518927 | 4.642 |
| 0.691013430374 | 6.396 |
| 0.690211436094 | 6.239 |
| 0.68764308726 | 6.219 |
| 0.686915761836 | 6.257 |
| 0.686191975513 | 5.535 |
| 0.68576505356 | 5.295 |
| 0.685351976019 | 7.663 |
| 0.685273608336 | 6.485 |
| 0.685269741449 | 6.307 |
| 0.685183052064 | 5.58 |
| 0.684676471874 | 6.115 |
| 0.683667368006 | 5.096 |
| 0.682794315355 | 6.294 |
| 0.682280060865 | 4.687 |
| 0.681910859879 | 4.76 |
| 0.681786879044 | 6.015 |
| 0.68140321627 | 6.282 |
| 0.67997498383 | 7.018 |
| 0.679941682551 | 8.311 |
| 0.679666924668 | 5.778 |
| 0.678829424185 | 5.404 |
| 0.678826255478 | 5.935 |
| 0.678268337142 | 4.515 |
| 0.678224984326 | 4.889 |
| 0.676807729619 | 5.67 |
| 0.675862006737 | 4.946 |
| 0.675426519546 | 7.004 |
| 0.675346475903 | 4.417 |
| 0.675111283873 | 5.925 |
| 0.672600550356 | 5.197 |
| 0.672425341971 | 5.657 |
| 0.672179337189 | 4.515 |
| 0.671055814855 | 8.52 |
| 0.670493001915 | 4.367 |
| 0.670395403741 | 6.163 |
| 0.668502395799 | 7.396 |
| 0.667967946569 | 7.009 |
| 0.667031303352 | 4.561 |
| 0.666180275044 | 6.708 |
| 0.66601951497 | 8.021 |
| 0.66516611844 | 5.897 |
| 0.664568304283 | 5.428 |
| 0.664275633075 | 4.997 |
| 0.663663240013 | 9.797 |
| 0.662428058596 | 7.863 |
| 0.659192500157 | 4.702 |
| 0.658211482752 | 6.227 |
| 0.656710544657 | 6.805 |
| 0.655108896748 | 5.711 |
| 0.654004145151 | 4.931 |
| 0.653988201273 | 8.023 |
| 0.652610412257 | 6.343 |
| 0.651798210904 | 4.537 |
| 0.651335522641 | 5.32 |
| 0.65101174116 | 6.779 |
| 0.649687172382 | 6.961 |
| 0.648865552588 | 6.393 |
| 0.648500533326 | 5.528 |
| 0.648466848616 | 5.359 |
| 0.648166815684 | 5.028 |
| 0.647725017494 | 4.83 |
| 0.647712421038 | 5.771 |
| 0.645533850713 | 5.273 |
| 0.645499464714 | 5.166 |
| 0.644663550014 | 5.98 |
| 0.643003112954 | 4.644 |
| 0.641827916773 | 7.851 |
| 0.641449692068 | 4.832 |
| 0.640897772487 | 5.209 |
| 0.640393381913 | 6.747 |
| 0.639663373947 | 6.075 |
| 0.639607964528 | 6.921 |
| 0.637888253701 | 4.793 |
| 0.637233995438 | 6.907 |
| 0.637004032777 | 6.52 |
| 0.636669416629 | 8.109 |
| 0.634491640494 | 4.59 |
| 0.634164127169 | 10.196 |
| 0.633951194157 | 5.932 |
| 0.633781066118 | 6.612 |
| 0.633520454374 | 5.649 |
| 0.633427990058 | 5.762 |
| 0.632964963943 | 5.492 |
| 0.631189103916 | 5.921 |
| 0.629136713816 | 5.175 |
| 0.628877626299 | 5.406 |
| 0.628335328922 | 7.776 |
| 0.627277010273 | 5.815 |
| 0.627069606187 | 6.147 |
| 0.62692412404 | 5.173 |
| 0.625586602527 | 5.209 |
| 0.623455572105 | 6.065 |
| 0.621625053838 | 5.717 |
| 0.6215545539 | 4.737 |
| 0.620970924058 | 4.571 |
| 0.620782026082 | 6.108 |
| 0.620603667673 | 5.665 |
| 0.618241330227 | 5.444 |
| 0.61673389735 | 4.609 |
| 0.616622885236 | 8.939 |
| 0.615776380807 | 7.615 |
| 0.61531814657 | 5.791 |
| 0.614747446123 | 4.234 |
| 0.614727051935 | 5.403 |
| 0.614449265222 | 4.014 |
| 0.614131732498 | 5.376 |
| 0.61350408137 | 5.071 |
| 0.612921311148 | 7.652 |
| 0.611030372632 | 6.369 |
| 0.60931777107 | 4.153 |
| 0.609048119245 | 5.087 |
| 0.608392719135 | 6.335 |
| 0.607914191706 | 5.729 |
| 0.607477911039 | 11.414 |
| 0.607462967079 | 8.878 |
| 0.607296174221 | 5.22 |
| 0.606021804625 | 6.23 |
| 0.60235050817 | 5.157 |
| 0.60138533876 | 5.631 |
| 0.600392541291 | 4.381 |
| 0.59944569467 | 7.044 |
| 0.599037685933 | 5.96 |
| 0.598625728386 | 9.326 |
| 0.598537358187 | 7.156 |
| 0.598515730572 | 5.033 |
| 0.598365205324 | 5.951 |
| 0.597742847013 | 5.584 |
| 0.596114801828 | 5.538 |
| 0.595699695311 | 8.176 |
| 0.595628637142 | 5.792 |
| 0.594216509621 | 4.977 |
| 0.593974443551 | 8.81 |
| 0.593575631026 | 4.318 |
| 0.592100305298 | 5.581 |
| 0.591854607699 | 5.291 |
| 0.591776186312 | 6.476 |
| 0.591652718266 | 4.595 |
| 0.591509588318 | 6.251 |
| 0.591319996238 | 5.275 |
| 0.590404585789 | 4.399 |
| 0.590398795682 | 5.194 |
| 0.589354701145 | 6.39 |
| 0.588744141264 | 4.176 |
| 0.588733914613 | 6.515 |
| 0.588290518439 | 4.978 |
| 0.586224149285 | 4.786 |
| 0.584108834992 | 5.79 |
| 0.583833189477 | 4.343 |
| 0.583622328734 | 4.082 |
| 0.58256500114 | 6.308 |
| 0.58126395803 | 9.09 |
| 0.579682732556 | 4.105 |
| 0.577611723333 | 5.77 |
| 0.577121747504 | 4.89 |
| 0.576628758138 | 5.787 |
| 0.576311972129 | 5.296 |
| 0.576229046562 | 5.12 |
| 0.576210707419 | 6.137 |
| 0.574090595158 | 4.399 |
| 0.573913151534 | 4.932 |
| 0.573032290638 | 6.976 |
| 0.572597957239 | 7.324 |
| 0.572261323039 | 5.984 |
| 0.572251448972 | 4.773 |
| 0.571835066736 | 4.113 |
| 0.571726673564 | 6.008 |
| 0.570112446674 | 6.149 |
| 0.56936564567 | 6.608 |
| 0.56758929202 | 7.929 |
| 0.567501865036 | 5.737 |
| 0.565072322975 | 7.72 |
| 0.562936194391 | 6.171 |
| 0.561980718915 | 5.042 |
| 0.561655127229 | 5.131 |
| 0.561454520147 | 6.888 |
| 0.561205009597 | 4.408 |
| 0.561056111227 | 4.679 |
| 0.559508563596 | 10.572 |
| 0.559374124463 | 4.519 |
| 0.559149298726 | 4.958 |
| 0.5589151425 | 5.935 |
| 0.557803123238 | 7.005 |
| 0.557158821553 | 5.104 |
| 0.5565918868 | 10.003 |
| 0.556360029547 | 6.993 |
| 0.555518722829 | 4.552 |
| 0.555019387579 | 6.608 |
| 0.553938597173 | 7.422 |
| 0.553261340274 | 7.087 |
| 0.551601408412 | 7.596 |
| 0.551228525814 | 6.475 |
| 0.551041665426 | 6.396 |
| 0.549584297836 | 6.002 |
| 0.549448214108 | 5.574 |
| 0.547628434556 | 6.719 |
| 0.547157604266 | 8.89 |
| 0.546999500724 | 6.002 |
| 0.546098477731 | 5.028 |
| 0.544776752471 | 4.247 |
| 0.543955692593 | 4.407 |
| 0.542711038951 | 6.905 |
| 0.541492889591 | 5.691 |
| 0.540937876829 | 7.274 |
| 0.540690390331 | 4.099 |
| 0.54055302562 | 7.161 |
| 0.539541430288 | 4.636 |
| 0.539208905556 | 4.446 |
| 0.538449855562 | 7.729 |
| 0.538365793086 | 4.961 |
| 0.538066875497 | 4.459 |
| 0.536872048195 | 6.689 |
| 0.536565329812 | 9.178 |
| 0.536167337112 | 9.165 |
| 0.534283335667 | 5.54 |
| 0.53297875665 | 6.291 |
| 0.532233968515 | 7.172 |
| 0.53142407383 | 4.079 |
| 0.530900335155 | 4.762 |
| 0.530882016099 | 7.736 |
| 0.530743516167 | 5.111 |
| 0.529910877962 | 6.236 |
| 0.52983707693 | 6.688 |
| 0.529244948167 | 5.052 |
| 0.528583397748 | 6.226 |
| 0.528462604426 | 6.474 |
| 0.526565988804 | 5.402 |
| 0.526146273884 | 5.204 |
| 0.525373704431 | 5.633 |
| 0.525277230744 | 16.908 |
| 0.525116575667 | 6.53 |
| 0.525007515568 | 4.785 |
| 0.524948967599 | 6.757 |
| 0.523752021934 | 6.997 |
| 0.523613159941 | 4.851 |
| 0.52343314975 | 4.507 |
| 0.523324338492 | 6.672 |
| 0.522783299102 | 8.168 |
| 0.522019357313 | 4.156 |
| 0.522008951905 | 5.021 |
| 0.520315461844 | 4.998 |
| 0.519524537942 | 10.105 |
| 0.519283530226 | 7.973 |
| 0.518111902284 | 5.963 |
| 0.517382994412 | 6.876 |
| 0.517025577872 | 4.628 |
| 0.51701911019 | 5.392 |
| 0.516162481766 | 6.446 |
| 0.515906327128 | 5.533 |
| 0.515506050354 | 4.152 |
| 0.514842558516 | 7.501 |
| 0.51448460688 | 5.269 |
| 0.513118687048 | 8.82 |
| 0.512474568195 | 6.179 |
| 0.508576925458 | 5.843 |
| 0.507899372524 | 11.844 |
| 0.50776181624 | 5.517 |
| 0.50772224664 | 5.373 |
| 0.507654923142 | 5.826 |
| 0.506634140036 | 4.943 |
| 0.505590037956 | 5.375 |
| 0.504303580234 | 7.106 |
| 0.504291474077 | 7.606 |
| 0.501413597298 | 7.135 |
| 0.500802053057 | 5.036 |
| 0.499920758023 | 8.043 |
| 0.499296648239 | 7.235 |
| 0.497921332798 | 6.574 |
| 0.497300927459 | 4.817 |
| 0.496228525105 | 7.257 |
| 0.495510258302 | 6.123 |
| 0.495472045774 | 8.909 |
| 0.494818784362 | 5.935 |
| 0.49457992167 | 5.744 |
| 0.494221337889 | 5.176 |
| 0.493795690707 | 6.301 |
| 0.493762686338 | 4.812 |
| 0.493626234385 | 4.146 |
| 0.493442601503 | 6.116 |
| 0.492890972536 | 4.556 |
| 0.492205359801 | 8.02 |
| 0.49176630787 | 10.009 |
| 0.491055765411 | 8.26 |
| 0.490749952061 | 7.243 |
| 0.490612677991 | 7.7 |
| 0.49020836547 | 6.004 |
| 0.48945740787 | 4.22 |
| 0.488429705925 | 5.693 |
| 0.488066083012 | 7.654 |
| 0.487380736044 | 5.773 |
| 0.487071861603 | 7.387 |
| 0.486647146782 | 5.446 |
| 0.485801601829 | 6.514 |
| 0.48542682717 | 6.24 |
| 0.484870446507 | 5.111 |
| 0.484568973694 | 8.33 |
| 0.484372225485 | 4.151 |
| 0.483829908841 | 7.35 |
| 0.48355197955 | 5.269 |
| 0.483304175918 | 5.355 |
| 0.483286353384 | 8.27 |
| 0.481041979296 | 4.88 |
| 0.480518653043 | 5.988 |
| 0.479380951205 | 6.501 |
| 0.479360172417 | 6.193 |
| 0.478941067638 | 6.844 |
| 0.478845468355 | 6.106 |
| 0.478739070992 | 5.012 |
| 0.478631265661 | 5.145 |
| 0.47812603493 | 7.389 |
| 0.478064088437 | 6.706 |
| 0.475189153413 | 6.593 |
| 0.474743745403 | 4.612 |
| 0.474500450719 | 6.937 |
| 0.474352351681 | 4.22 |
| 0.474257751901 | 5.752 |
| 0.473338958331 | 4.871 |
| 0.47269917226 | 8.317 |
| 0.471502108689 | 6.461 |
| 0.471069244708 | 6.733 |
| 0.469485283301 | 4.112 |
| 0.468986598526 | 6.241 |
| 0.468954392756 | 5.823 |
| 0.468763497539 | 6.193 |
| 0.468750949227 | 5.879 |
| 0.468496966742 | 4.904 |
| 0.467157000139 | 6.545 |
| 0.466385082918 | 7.407 |
| 0.465737198647 | 7.168 |
| 0.465707752938 | 4.69 |
| 0.465450295029 | 5.909 |
| 0.465279736491 | 6.191 |
| 0.465260697439 | 4.057 |
| 0.464587088698 | 5.389 |
| 0.463909153573 | 6.483 |
| 0.463419831054 | 4.212 |
| 0.463132445175 | 7.734 |
| 0.459589817556 | 5.262 |
| 0.457451254509 | 7.565 |
| 0.456951502695 | 6.69 |
| 0.456272521836 | 10.454 |
| 0.454783202991 | 6.597 |
| 0.454372102589 | 4.176 |
| 0.453256821509 | 5.488 |
| 0.452817506009 | 12.348 |
| 0.45266066066 | 5.105 |
| 0.45170403684 | 5.477 |
| 0.450036812243 | 6.829 |
| 0.44980291744 | 6.656 |
| 0.449575917983 | 4.692 |
| 0.448903787748 | 6.445 |
| 0.448451525288 | 6.427 |
| 0.447856999963 | 8.392 |
| 0.447541674231 | 4.727 |
| 0.446952679356 | 4.697 |
| 0.446415687756 | 6.275 |
| 0.445940590576 | 8.379 |
| 0.444802894526 | 5.229 |
| 0.444784842673 | 4.564 |
| 0.444745321654 | 5.694 |
| 0.44473885723 | 7.369 |
| 0.444545082996 | 7.254 |
| 0.443271180008 | 5.721 |
| 0.443105434561 | 6.685 |
| 0.44290327855 | 5.842 |
| 0.441719974443 | 5.658 |
| 0.44069788515 | 6.824 |
| 0.440324698541 | 4.369 |
| 0.439799152757 | 4.469 |
| 0.439382721396 | 7.321 |
| 0.437523998914 | 6.118 |
| 0.437230697279 | 6.654 |
| 0.436926521574 | 6.52 |
| 0.436760095019 | 13.894 |
| 0.433872134071 | 7.165 |
| 0.432884464026 | 5.023 |
| 0.432497320871 | 7.046 |
| 0.432445124506 | 9.733 |
| 0.431670091167 | 4.604 |
| 0.427978397263 | 6.931 |
| 0.427844356206 | 5.081 |
| 0.427660746185 | 5.635 |
| 0.427525521225 | 5.612 |
| 0.427290657189 | 4.243 |
| 0.427153785595 | 7.179 |
| 0.425876352874 | 6.04 |
| 0.425732100075 | 5.531 |
| 0.425116162898 | 5.594 |
| 0.424594868619 | 5.745 |
| 0.42313799805 | 7.763 |
| 0.422559806351 | 7.778 |
| 0.422206185039 | 5.193 |
| 0.42197953922 | 11.525 |
| 0.421785468918 | 7.103 |
| 0.42169338023 | 7.47 |
| 0.421061286907 | 7.519 |
| 0.419630610579 | 4.727 |
| 0.419225296242 | 4.531 |
| 0.419067672565 | 6.883 |
| 0.418664938844 | 5.711 |
| 0.417387018812 | 5.51 |
| 0.417100555602 | 6.924 |
| 0.417051030716 | 7.007 |
| 0.416876498943 | 4.726 |
| 0.415583044773 | 5.501 |
| 0.41531295418 | 6.921 |
| 0.415257405543 | 6.239 |
| 0.415037499279 | 6.851 |
| 0.413295323604 | 12.836 |
| 0.411314413236 | 5.226 |
| 0.410502773113 | 6.761 |
| 0.409691349547 | 6.445 |
| 0.409311391312 | 6.691 |
| 0.408327277689 | 4.862 |
| 0.40779140147 | 5.834 |
| 0.405855856969 | 7.248 |
| 0.405466918863 | 4.978 |
| 0.403896941674 | 6.751 |
| 0.402959203476 | 5.659 |
| 0.402343653913 | 4.635 |
| 0.40226643588 | 5.865 |
| 0.401882838145 | 9.502 |
| 0.401032299516 | 6.187 |
| 0.400898198044 | 5.366 |
| 0.400249419426 | 5.235 |
| 0.399965403145 | 6.126 |
| 0.399579115831 | 4.173 |
| 0.398182455905 | 5.951 |
| 0.398044428366 | 4.842 |
| 0.397743876586 | 4.631 |
| 0.397681067682 | 6.248 |
| 0.397654404352 | 7.214 |
| 0.397402902862 | 8.719 |
| 0.396166916691 | 7.767 |
| 0.395514941014 | 4.2 |
| 0.393649214824 | 8.787 |
| 0.390852973455 | 8.066 |
| 0.390750489175 | 6.827 |
| 0.389724978162 | 7.679 |
| 0.389595869357 | 5.088 |
| 0.389012035736 | 5.884 |
| 0.38752918393 | 4.474 |
| 0.387023123109 | 5.092 |
| 0.387023123109 | 4.322 |
| 0.38650668538 | 11.506 |
| 0.385678225416 | 5.022 |
| 0.385237486442 | 5.863 |
| 0.384936847879 | 5.74 |
| 0.384657700024 | 6.834 |
| 0.382898653587 | 4.091 |
| 0.382737007376 | 4.148 |
| 0.38226259675 | 5.812 |
| 0.381536393904 | 5.705 |
| 0.381280229381 | 5.306 |
| 0.380348774119 | 4.667 |
| 0.380235616736 | 4.407 |
| 0.377756483199 | 6.129 |
| 0.377152086441 | 4.763 |
| 0.375198112833 | 5.199 |
| 0.373922732526 | 4.859 |
| 0.373570881983 | 4.297 |
| 0.372894159515 | 4.902 |
| 0.372060009692 | 7.737 |
| 0.37064337992 | 4.944 |
| 0.369871183231 | 4.864 |
| 0.369534639968 | 6.052 |
| 0.36939049661 | 6.334 |
| 0.36897787978 | 6.435 |
| 0.368884902788 | 5.487 |
| 0.367601571491 | 7.612 |
| 0.365932026821 | 5.413 |
| 0.365316308179 | 6.928 |
| 0.364934184856 | 6.198 |
| 0.363975530096 | 4.109 |
| 0.363326285096 | 5.954 |
| 0.36298414594 | 8.389 |
| 0.3627969539 | 5.991 |
| 0.36249879118 | 7.259 |
| 0.361399535677 | 4.764 |
| 0.361381386351 | 7.885 |
| 0.359468790794 | 5.494 |
| 0.358477699254 | 4.741 |
| 0.358369492243 | 7.957 |
| 0.358080360904 | 5.428 |
| 0.357949627486 | 8.69 |
| 0.357785016819 | 6.085 |
| 0.357247145016 | 5.896 |
| 0.356783895204 | 7.764 |
| 0.355807251809 | 6.768 |
| 0.35538929628 | 6.791 |
| 0.354391395282 | 7.287 |
| 0.353371142538 | 4.358 |
| 0.353340448051 | 6.054 |
| 0.35283461043 | 4.684 |
| 0.352486734829 | 6.638 |
| 0.351935821468 | 6.566 |
| 0.351918697885 | 6.499 |
| 0.349334252228 | 6.648 |
| 0.348861296865 | 7.42 |
| 0.348831840013 | 7.424 |
| 0.347788238585 | 4.03 |
| 0.347652628928 | 5.071 |
| 0.345689452588 | 4.928 |
| 0.345579757809 | 7.065 |
| 0.345307355213 | 6.086 |
| 0.344100526513 | 6.33 |
| 0.343560491306 | 4.988 |
| 0.343156738008 | 6.604 |
| 0.341886047353 | 6.734 |
| 0.341786493718 | 6.969 |
| 0.341699378799 | 6.36 |
| 0.341351951146 | 4.99 |
| 0.341136692726 | 6.087 |
| 0.341101759519 | 6.297 |
| 0.340301180984 | 5.903 |
| 0.339919848448 | 4.467 |
| 0.338834809844 | 7.693 |
| 0.338391541248 | 4.528 |
| 0.338349698343 | 7.279 |
| 0.338208405139 | 7.518 |
| 0.338179823783 | 5.425 |
| 0.337805913052 | 8.043 |
| 0.33751503754 | 5.375 |
| 0.33695630412 | 4.026 |
| 0.336719953967 | 4.639 |
| 0.33655287419 | 6.569 |
| 0.336539965814 | 5.894 |
| 0.335759268696 | 7.494 |
| 0.335440672781 | 5.05 |
| 0.334932108795 | 6.284 |
| 0.334419039071 | 6.333 |
| 0.333617397064 | 5.785 |
| 0.332637084283 | 6.26 |
| 0.332578228774 | 10.958 |
| 0.33248368994 | 5.681 |
| 0.332445966801 | 4.408 |
| 0.331159476804 | 6.965 |
| 0.330679596935 | 9.925 |
| 0.329893305132 | 4.649 |
| 0.329491861023 | 4.09 |
| 0.328571368518 | 5.849 |
| 0.328499093346 | 7.738 |
| 0.327174509042 | 5.563 |
| 0.326268034648 | 4.206 |
| 0.325733311204 | 4.151 |
| 0.324830678166 | 5.837 |
| 0.324814929349 | 7.483 |
| 0.324441669943 | 5.026 |
| 0.324232515533 | 6.65 |
| 0.323525336038 | 6.966 |
| 0.3229746053 | 7.325 |
| 0.322594752673 | 7.08 |
| 0.321694062112 | 6.361 |
| 0.320640549027 | 4.598 |
| 0.31954150205 | 4.173 |
| 0.319039815563 | 5.726 |
| 0.319010611505 | 5.938 |
| 0.318865246008 | 6.684 |
| 0.318075769392 | 5.42 |
| 0.317613117431 | 6.597 |
| 0.316838757911 | 7.212 |
| 0.315034854423 | 6.482 |
| 0.314543637697 | 5.301 |
| 0.314354875183 | 4.013 |
| 0.31408734167 | 5.005 |
| 0.313943729836 | 4.006 |
| 0.313759378307 | 5.792 |
| 0.312549762572 | 7.955 |
| 0.312185707458 | 6.121 |
| 0.311849431269 | 5.209 |
| 0.311651154009 | 4.355 |
| 0.311490302343 | 6.214 |
| 0.310762177235 | 6.286 |
| 0.310567806761 | 9.226 |
| 0.310190471212 | 5.08 |
| 0.308888504441 | 6.813 |
| 0.307746479346 | 6.463 |
| 0.307474507528 | 9.363 |
| 0.306759976998 | 6.24 |
| 0.305889884796 | 4.07 |
| 0.305381786007 | 4.277 |
| 0.305247334417 | 6.196 |
| 0.304903807666 | 7.764 |
| 0.304854581528 | 4.496 |
| 0.304601139616 | 7.048 |
| 0.303969003549 | 5.074 |
| 0.303706544164 | 6.614 |
| 0.303275523395 | 5.544 |
| 0.302876823643 | 4.202 |
| 0.302391743402 | 5.909 |
| 0.301997246086 | 6.305 |
| 0.301783640891 | 4.17 |
| 0.300733872618 | 6.787 |
| 0.300608371292 | 4.582 |
| 0.300179476664 | 11.054 |
| 0.299654894119 | 4.341 |
| 0.29898538843 | 4.754 |
| 0.298185753376 | 9.622 |
| 0.298168800542 | 7.091 |
| 0.297518064685 | 6.733 |
| 0.296745443425 | 4.403 |
| 0.296198556383 | 5.455 |
| 0.295534000051 | 5.905 |
| 0.295488444493 | 6.172 |
| 0.293280692702 | 7.514 |
| 0.292628080189 | 6.601 |
| 0.291720358677 | 4.229 |
| 0.291636056756 | 5.465 |
| 0.290703377978 | 5.716 |
| 0.290628028088 | 6.825 |
| 0.290386502398 | 10.607 |
| 0.28833381352 | 6.295 |
| 0.287952873751 | 6.015 |
| 0.287744174131 | 7.588 |
| 0.287181361172 | 12.116 |
| 0.286881147788 | 5.109 |
| 0.28646163305 | 5.579 |
| 0.285496343478 | 5.082 |
| 0.28505689132 | 8.721 |
| 0.283407947412 | 6.804 |
| 0.28180373244 | 6.279 |
| 0.28081823707 | 4.512 |
| 0.280363085309 | 6.029 |
| 0.280342366315 | 7.241 |
| 0.278621733539 | 6.571 |
| 0.278411753177 | 6.127 |
| 0.278272871853 | 5.868 |
| 0.277613416901 | 4.864 |
| 0.276701868615 | 5.295 |
| 0.275359604295 | 5.896 |
| 0.274417132462 | 4.445 |
| 0.274228991902 | 4.439 |
| 0.273936531371 | 6.096 |
| 0.273117393809 | 6.037 |
| 0.273018494406 | 4.868 |
| 0.271036648502 | 7.014 |
| 0.270480771605 | 5.196 |
| 0.270119734446 | 4.608 |
| 0.269314719705 | 5.836 |
| 0.26923193932 | 4.852 |
| 0.269040281463 | 4.129 |
| 0.268252115105 | 6.413 |
| 0.266826891098 | 4.892 |
| 0.266621888951 | 4.589 |
| 0.266153747678 | 5.867 |
| 0.265455797429 | 8.445 |
| 0.264545872751 | 6.435 |
| 0.264400304507 | 8.392 |
| 0.263813609223 | 6.064 |
| 0.263731191668 | 5.208 |
| 0.262908246502 | 5.355 |
| 0.262422112176 | 6.906 |
| 0.26235163486 | 4.906 |
| 0.262171534744 | 8.284 |
| 0.260920179347 | 5.287 |
| 0.260908599425 | 7.138 |
| 0.260720539996 | 5.811 |
| 0.260057222015 | 7.856 |
| 0.258160535679 | 6.405 |
| 0.257353319575 | 8.463 |
| 0.256636634636 | 4.846 |
| 0.256370934194 | 6.546 |
| 0.256013978156 | 5.907 |
| 0.255757124459 | 10.433 |
| 0.255648005966 | 5.262 |
| 0.255185974766 | 6.379 |
| 0.25498262875 | 7.303 |
| 0.25442503647 | 5.626 |
| 0.252361753351 | 4.893 |
| 0.252276529753 | 6.894 |
| 0.251982731349 | 7.843 |
| 0.251640272311 | 7.214 |
| 0.250991557115 | 6.718 |
| 0.249536965779 | 8.459 |
| 0.249449687869 | 5.91 |
| 0.248370451963 | 6.801 |
| 0.247869273797 | 7.146 |
| 0.24723072761 | 4.176 |
| 0.24586717802 | 7.442 |
| 0.245685581905 | 7.056 |
| 0.245610516047 | 8.993 |
| 0.245520442146 | 4.195 |
| 0.245476034449 | 6.227 |
| 0.244280445768 | 6.13 |
| 0.244076855837 | 14.388 |
| 0.242445524107 | 6.784 |
| 0.241769054762 | 4.946 |
| 0.241598294761 | 9.721 |
| 0.241190016791 | 6.035 |
| 0.24025066881 | 6.834 |
| 0.239867087865 | 4.338 |
| 0.23937995912 | 6.336 |
| 0.238608136556 | 6.079 |
| 0.23852471141 | 6.133 |
| 0.238200733914 | 6.63 |
| 0.238188171126 | 4.526 |
| 0.237915710316 | 6.966 |
| 0.237440224417 | 4.17 |
| 0.2371078987 | 5.343 |
| 0.236885792543 | 5.408 |
| 0.236826958236 | 4.083 |
| 0.236784901733 | 5.786 |
| 0.23632535091 | 5.335 |
| 0.234960656277 | 5.211 |
| 0.234805204557 | 4.739 |
| 0.234325450832 | 6.473 |
| 0.234251821424 | 6.955 |
| 0.23385091967 | 7.516 |
| 0.232849603579 | 7.368 |
| 0.231935849022 | 4.784 |
| 0.231581592791 | 6.067 |
| 0.231005551641 | 5.283 |
| 0.23022551171 | 4.782 |
| 0.229649705709 | 6.137 |
| 0.229224733359 | 10.304 |
| 0.228934465332 | 4.601 |
| 0.227149870135 | 5.461 |
| 0.226986924384 | 6.631 |
| 0.226206402268 | 8.443 |
| 0.226130580619 | 7.247 |
| 0.22563868944 | 6.615 |
| 0.224786936477 | 5.323 |
| 0.224242149189 | 6.578 |
| 0.223943001084 | 5.187 |
| 0.222208785905 | 8.923 |
| 0.220555418939 | 8.364 |
| 0.219527087642 | 4.146 |
| 0.219501511279 | 3.999 |
| 0.219384925895 | 5.444 |
| 0.219080003335 | 11.734 |
| 0.218515739055 | 7.088 |
| 0.217131086025 | 6.692 |
| 0.215728691055 | 4.204 |
| 0.215093992132 | 5.108 |
| 0.214236972593 | 4.183 |
| 0.214037371939 | 5.165 |
| 0.212629452397 | 4.867 |
| 0.212458331726 | 4.841 |
| 0.212158859844 | 8.884 |
| 0.210695439655 | 8.001 |
| 0.21021770739 | 6.479 |
| 0.209826753167 | 8.221 |
| 0.209122123485 | 4.751 |
| 0.208061749269 | 7.01 |
| 0.207546456592 | 6.394 |
| 0.205718242778 | 5.467 |
| 0.205419342733 | 4.398 |
| 0.205299331544 | 4.972 |
| 0.204562168308 | 7.243 |
| 0.2030327458 | 6.98 |
| 0.202254456639 | 9.384 |
| 0.202192888321 | 6.873 |
| 0.20192087054 | 11.382 |
| 0.201886200675 | 5.558 |
| 0.201146845607 | 4.881 |
| 0.199645740113 | 10.233 |
| 0.199318088064 | 6.738 |
| 0.198771180739 | 6.714 |
| 0.197934176959 | 7.245 |
| 0.197735586977 | 5.844 |
| 0.196532396178 | 8.713 |
| 0.196397212804 | 4.688 |
| 0.195382404413 | 4.91 |
| 0.195256291399 | 4.68 |
| 0.193073029211 | 4.705 |
| 0.192995034291 | 5.432 |
| 0.192752035354 | 5.135 |
| 0.191659293797 | 4.493 |
| 0.190947097978 | 7.464 |
| 0.190528614714 | 5.538 |
| 0.18711096245 | 7.025 |
| 0.186324227569 | 10.76 |
| 0.186133077635 | 4.684 |
| 0.184954623684 | 5.95 |
| 0.18457515775 | 6.338 |
| 0.184101266381 | 7.13 |
| 0.183298920075 | 16.603 |
| 0.182984373341 | 9.235 |
| 0.182940463663 | 6.416 |
| 0.182839905978 | 10.757 |
| 0.181737987417 | 6.643 |
| 0.181446871338 | 4.695 |
| 0.181101687692 | 6.279 |
| 0.180553908357 | 6.611 |
| 0.180460598604 | 6.814 |
| 0.180244862639 | 6.776 |
| 0.180217120707 | 5.643 |
| 0.179489865478 | 5.228 |
| 0.179330971893 | 7.356 |
| 0.179174076184 | 9.122 |
| 0.178516205791 | 5.671 |
| 0.176968278446 | 5.255 |
| 0.176877762084 | 4.524 |
| 0.176840729928 | 7.309 |
| 0.176411398724 | 5.84 |
| 0.175410775772 | 7.359 |
| 0.174397999753 | 7.039 |
| 0.173567071605 | 6.031 |
| 0.173302888822 | 4.261 |
| 0.17309576105 | 4.017 |
| 0.17283405043 | 7.595 |
| 0.172610736156 | 11.184 |
| 0.172033773474 | 6.318 |
| 0.171457624829 | 8.113 |
| 0.170453945551 | 5.986 |
| 0.170303910188 | 4.086 |
| 0.17015431004 | 4.843 |
| 0.168314357671 | 6.013 |
| 0.168111002026 | 11.195 |
| 0.167364168361 | 6.923 |
| 0.166358386422 | 4.454 |
| 0.166260546739 | 4.137 |
| 0.165572601776 | 4.722 |
| 0.164754888253 | 5.409 |
| 0.164561704664 | 5.795 |
| 0.164376860348 | 5.532 |
| 0.16354106607 | 9.146 |
| 0.163314043677 | 7.198 |
| 0.162829423507 | 4.553 |
| 0.162003433067 | 6.214 |
| 0.161743460488 | 9.247 |
| 0.161273865357 | 5.348 |
| 0.161074678351 | 5.693 |
| 0.161001997304 | 9.133 |
| 0.160464672193 | 5.323 |
| 0.160276332341 | 7.083 |
| 0.158372864741 | 8.767 |
| 0.157709386747 | 7.095 |
| 0.15737744297 | 4.191 |
| 0.157324964663 | 5.245 |
| 0.156702682313 | 6.87 |
| 0.156593071207 | 5.986 |
| 0.156293682784 | 7.284 |
| 0.155415905653 | 7.12 |
| 0.155380453647 | 5.576 |
| 0.155337842207 | 6.171 |
| 0.154882080208 | 5.668 |
| 0.154170930128 | 4.223 |
| 0.154106287171 | 5.548 |
| 0.15312884943 | 6.275 |
| 0.152854137615 | 7.504 |
| 0.152402045204 | 8.32 |
| 0.152219049593 | 5.368 |
| 0.152188637146 | 4.992 |
| 0.152003093445 | 4.092 |
| 0.151450759962 | 6.026 |
| 0.151447569741 | 4.388 |
| 0.151068398614 | 9.897 |
| 0.150989812383 | 5.36 |
| 0.150790962871 | 6.708 |
| 0.149969111235 | 6.177 |
| 0.149894010816 | 8.721 |
| 0.14877802389 | 5.085 |
| 0.14850850352 | 11.245 |
| 0.147933429136 | 4.927 |
| 0.147279660147 | 9.236 |
| 0.146993061555 | 6.132 |
| 0.145821935897 | 4.263 |
| 0.145332065307 | 7.43 |
| 0.14513161674 | 4.209 |
| 0.143944408956 | 11.241 |
| 0.143739047212 | 6.177 |
| 0.143348628135 | 4.666 |
| 0.14183563951 | 8.968 |
| 0.141431085617 | 4.966 |
| 0.139890116587 | 6.232 |
| 0.139722952173 | 9.006 |
| 0.137704820672 | 5.748 |
| 0.13703251655 | 4.485 |
| 0.136980902827 | 6.286 |
| 0.135552994185 | 5.598 |
| 0.135162563114 | 8.686 |
| 0.134776679334 | 6.98 |
| 0.134594964512 | 5.753 |
| 0.134473168887 | 5.251 |
| 0.134058438437 | 5.342 |
| 0.133913187041 | 6.421 |
| 0.132340732071 | 8.959 |
| 0.131631283436 | 9.717 |
| 0.131623720875 | 4.029 |
| 0.131196759546 | 4.728 |
| 0.129781271152 | 5.57 |
| 0.128895818918 | 8.07 |
| 0.127708272459 | 7.428 |
| 0.127159022468 | 4.47 |
| 0.127025438356 | 5.628 |
| 0.126667847263 | 4.4 |
| 0.126511859254 | 6.471 |
| 0.126331800908 | 5.526 |
| 0.126143166461 | 6.015 |
| 0.126034388503 | 13.058 |
| 0.125888294458 | 4.329 |
| 0.124158194025 | 5.425 |
| 0.123735368422 | 6.274 |
| 0.123644208043 | 5.469 |
| 0.121972654535 | 7.502 |
| 0.119951510105 | 4.051 |
| 0.119216155198 | 5.072 |
| 0.118551781288 | 6.89 |
| 0.11847537452 | 6.012 |
| 0.117890819882 | 4.98 |
| 0.116432142434 | 5.328 |
| 0.116159181527 | 7.036 |
| 0.115983100789 | 7.353 |
| 0.11531376701 | 4.77 |
| 0.114028397702 | 6.705 |
| 0.11353745909 | 4.176 |
| 0.11353220393 | 13.433 |
| 0.113132237894 | 4.371 |
| 0.112908406797 | 4.426 |
| 0.112833641619 | 5.558 |
| 0.112396799802 | 5.828 |
| 0.110043636825 | 6.401 |
| 0.109160092439 | 5.139 |
| 0.109053959996 | 6.341 |
| 0.108024163733 | 8.436 |
| 0.10779433562 | 4.688 |
| 0.107096846352 | 7.357 |
| 0.106771663597 | 8.215 |
| 0.10636682442 | 6.339 |
| 0.105968958117 | 6.202 |
| 0.105858968062 | 9.422 |
| 0.105162416412 | 5.105 |
| 0.104988476099 | 4.743 |
| 0.103711349522 | 4.484 |
| 0.102576728712 | 5.355 |
| 0.102338858367 | 7.325 |
| 0.102143270379 | 11.822 |
| 0.101933708321 | 6.637 |
| 0.101748810715 | 6.824 |
| 0.10097075714 | 9.313 |
| 0.100754438535 | 7.373 |
| 0.100576954752 | 5.663 |
| 0.100243281694 | 4.605 |
| 0.0998168732479 | 5.799 |
| 0.0986842748594 | 7.864 |
| 0.0982462322992 | 7.026 |
| 0.0980675960991 | 6.999 |
| 0.097813141826 | 8.537 |
| 0.0967952004549 | 7.181 |
| 0.0960733296943 | 7.561 |
| 0.0960690558304 | 9.375 |
| 0.0956684573835 | 8.943 |
| 0.0947158826288 | 7.97 |
| 0.0939927615594 | 5.57 |
| 0.0928514462659 | 13.603 |
| 0.0928410209769 | 4.31 |
| 0.092072613085 | 4.698 |
| 0.0912356519505 | 9.282 |
| 0.0912218010332 | 5.596 |
| 0.09077844825 | 5.78 |
| 0.090500249441 | 6.367 |
| 0.0904152952222 | 5.835 |
| 0.0904152952222 | 4.579 |
| 0.0899878127498 | 5.392 |
| 0.0893082309159 | 7.946 |
| 0.0887788960291 | 5.423 |
| 0.0886478539218 | 5.896 |
| 0.0876763145923 | 8.458 |
| 0.0873185067956 | 7.593 |
| 0.0872771303611 | 6.217 |
| 0.0871957793587 | 4.99 |
| 0.0870618512887 | 5.683 |
| 0.0863144989148 | 12.38 |
| 0.0855855540097 | 6.29 |
| 0.0836301570505 | 5.466 |
| 0.0832344306152 | 6.287 |
| 0.0825428121146 | 13.468 |
| 0.082237290087 | 6.317 |
| 0.0818083442971 | 4.991 |
| 0.0818081676792 | 7.632 |
| 0.0813463447067 | 7.376 |
| 0.0813280550782 | 5.414 |
| 0.0798604582219 | 6.566 |
| 0.0796448434285 | 5.626 |
| 0.0787324361458 | 4.624 |
| 0.0784196567319 | 4.423 |
| 0.0782721292703 | 5.83 |
| 0.0782670567973 | 7.41 |
| 0.0781719915951 | 7.364 |
| 0.0776438032248 | 6.189 |
| 0.0776308589897 | 6.812 |
| 0.0771584581519 | 9.428 |
| 0.076131069216 | 6.127 |
| 0.0760404475183 | 5.835 |
| 0.0757474115607 | 6.218 |
| 0.0748736193166 | 5.64 |
| 0.0748231767569 | 4.973 |
| 0.0746817405881 | 4.035 |
| 0.0738659236225 | 6.247 |
| 0.0736345173884 | 6.646 |
| 0.0735378768737 | 5.343 |
| 0.0734978126494 | 5.701 |
| 0.0727774401743 | 4.459 |
| 0.0727221399498 | 5.801 |
| 0.0722604346067 | 4.215 |
| 0.0716485865475 | 6.702 |
| 0.0698284204756 | 10.487 |
| 0.0695595641787 | 4.143 |
| 0.0684601191215 | 4.854 |
| 0.0684164631721 | 4.134 |
| 0.0681715026416 | 7.814 |
| 0.0678214926702 | 4.566 |
| 0.0670710524192 | 6.529 |
| 0.066464147009 | 7.726 |
| 0.0661988194375 | 6.749 |
| 0.0658592850034 | 5.492 |
| 0.0650542535838 | 4.951 |
| 0.0649060550029 | 7.949 |
| 0.0646913588675 | 7.489 |
| 0.064248651377 | 6.227 |
| 0.0641917117222 | 5.351 |
| 0.0628408735702 | 4.08 |
| 0.0622877666018 | 6.883 |
| 0.0609842283954 | 6.634 |
| 0.0600162539944 | 6.594 |
| 0.0590050897749 | 6.386 |
| 0.0584972119969 | 6.952 |
| 0.0583452921864 | 6.082 |
| 0.0583014726034 | 10.685 |
| 0.0580690562555 | 5.483 |
| 0.0578041339104 | 8.124 |
| 0.0576319975016 | 8.486 |
| 0.0569703041203 | 5.692 |
| 0.0567225900119 | 4.55 |
| 0.0566668834007 | 5.313 |
| 0.0553307063516 | 5.981 |
| 0.0543948381706 | 7.525 |
| 0.0536909802276 | 7.006 |
| 0.0527928716406 | 4.966 |
| 0.0519961345554 | 7.432 |
| 0.0506004109698 | 9.207 |
| 0.0489962036742 | 6.946 |
| 0.0488801814404 | 6.626 |
| 0.0484023604584 | 4.991 |
| 0.0473420300058 | 6.69 |
| 0.0473057147784 | 4.303 |
| 0.0471829165452 | 5.23 |
| 0.0471184247559 | 4.264 |
| 0.0458036896131 | 4.67 |
| 0.0453398847791 | 7.239 |
| 0.0451362972405 | 7.016 |
| 0.0449124218756 | 5.5 |
| 0.0447430668348 | 8.553 |
| 0.0432674539042 | 4.644 |
| 0.0424471579954 | 7.147 |
| 0.0423020981312 | 7.596 |
| 0.0411573247568 | 4.164 |
| 0.0408403612651 | 4.285 |
| 0.0403877875024 | 6.048 |
| 0.0402901505629 | 7.593 |
| 0.0400973314836 | 5.296 |
| 0.0389806231721 | 7.428 |
| 0.0384101233603 | 4.526 |
| 0.0373412349012 | 9.637 |
| 0.037128853988 | 10.625 |
| 0.0348911500669 | 6.451 |
| 0.0333223879025 | 6.835 |
| 0.0328254635715 | 6.778 |
| 0.0324625795297 | 7.557 |
| 0.0324388354059 | 5.184 |
| 0.0322403370002 | 4.789 |
| 0.0317566178877 | 7.423 |
| 0.0309736035961 | 4.478 |
| 0.0306768151588 | 5.495 |
| 0.0304990176947 | 7.627 |
| 0.0300095457496 | 5.8 |
| 0.028870782461 | 9.638 |
| 0.0271482884192 | 7.346 |
| 0.0257747983208 | 6.023 |
| 0.0255350921071 | 4.094 |
| 0.025355163556 | 7.942 |
| 0.0249085749139 | 4.393 |
| 0.0246830816022 | 14.454 |
| 0.0244297930128 | 7.781 |
| 0.0241143753765 | 6.371 |
| 0.0239258392455 | 4.531 |
| 0.0218681536569 | 4.589 |
| 0.0216604186687 | 5.945 |
| 0.0207943352039 | 6.985 |
| 0.0199789620306 | 6.396 |
| 0.0196359311161 | 6.771 |
| 0.0191935652333 | 5.463 |
| 0.0191139375364 | 7.214 |
| 0.0188780102057 | 7.627 |
| 0.0174977562358 | 8.986 |
| 0.0173840541858 | 6.442 |
| 0.0169681696661 | 6.683 |
| 0.016897534944 | 5.382 |
| 0.0164914294128 | 7.633 |
| 0.0145336525368 | 5.872 |
| 0.0132098572176 | 4.887 |
| 0.0130407592345 | 5.641 |
| 0.0128653819319 | 8.897 |
| 0.0117055006523 | 4.227 |
| 0.0109950072579 | 5.758 |
| 0.0107468468811 | 7.845 |
| 0.0100148920239 | 7.007 |
| 0.00976708016111 | 5.785 |
| 0.00802457411079 | 10.678 |
| 0.00790519808535 | 4.818 |
| 0.007831099243 | 9.559 |
| 0.00574219896154 | 8.881 |
| 0.00550221936973 | 7.593 |
| 0.00364662447774 | 5.961 |
| 0.00303938674401 | 5.806 |
| 0.00231133191933 | 9.944 |
| 0.00216350209137 | 5.286 |
| 0.00187880696398 | 9.148 |
| 0.00179405219427 | 9.787 |
| 0.00164785288148 | 7.12 |
| 0.00153887485619 | 4.15 |
| 0.00138654027096 | 5.344 |
| 0.00118371515592 | 7.406 |
| 0.000844422055649 | 6.665 |
| 0.000205146824503 | 7.126 |
| -0.00107268007486 | 8.916 |
| -0.00151782764225 | 5.21 |
| -0.00245322712181 | 8.506 |
| -0.00431191864959 | 6.309 |
| -0.00503910760609 | 4.788 |
| -0.00516698699467 | 7.279 |
| -0.00552161837849 | 9.278 |
| -0.00662681945894 | 7.2 |
| -0.00887815134645 | 4.209 |
| -0.00963557701475 | 7.301 |
| -0.0112956256612 | 4.459 |
| -0.0122378258478 | 6.981 |
| -0.0125002209009 | 8.332 |
| -0.0129261744443 | 4.255 |
| -0.0132678601032 | 6.351 |
| -0.0138766976948 | 7.933 |
| -0.0138974160042 | 6.53 |
| -0.0141637098068 | 7.015 |
| -0.0152465888316 | 6.223 |
| -0.0153183345014 | 5.338 |
| -0.0159224197475 | 6.364 |
| -0.0162680846079 | 10.993 |
| -0.0177201209214 | 5.251 |
| -0.0188125014587 | 5.801 |
| -0.0189868887417 | 5.619 |
| -0.0190097571617 | 6.517 |
| -0.019785842106 | 5.087 |
| -0.0201095754622 | 6.636 |
| -0.0221531422386 | 5.346 |
| -0.022333864467 | 6.02 |
| -0.0230018253616 | 4.432 |
| -0.0241423458978 | 4.967 |
| -0.0244426861583 | 5.53 |
| -0.024458966276 | 5.332 |
| -0.0248653483316 | 7.049 |
| -0.0251748236471 | 5.724 |
| -0.0254787203169 | 7.17 |
| -0.0259002870998 | 6.016 |
| -0.0261975169504 | 5.727 |
| -0.0266285714059 | 4.705 |
| -0.0273663059381 | 5.4 |
| -0.0277449904829 | 4.703 |
| -0.0281326831967 | 8.913 |
| -0.03018727934 | 6.979 |
| -0.0304444759763 | 7.414 |
| -0.0315010008021 | 8.786 |
| -0.0315095338941 | 7.545 |
| -0.0318164472617 | 6.544 |
| -0.0323272995331 | 6.576 |
| -0.0326756746873 | 4.457 |
| -0.0327428866927 | 6.242 |
| -0.0335853165373 | 7.046 |
| -0.034968140172 | 7.442 |
| -0.0354571338169 | 5.052 |
| -0.0358508905535 | 11.531 |
| -0.0384002416912 | 6.168 |
| -0.038500476048 | 4.819 |
| -0.0394072344434 | 7.829 |
| -0.039724304808 | 13.177 |
| -0.0399470271888 | 7.283 |
| -0.0399521254001 | 6.048 |
| -0.0402914329124 | 7.181 |
| -0.0405853204475 | 8.646 |
| -0.0412925494423 | 9.985 |
| -0.0428399587041 | 7.952 |
| -0.0430528533652 | 8.759 |
| -0.0434898237749 | 6.183 |
| -0.0435539125635 | 6.456 |
| -0.0451463966755 | 8.615 |
| -0.0452510810949 | 6.202 |
| -0.0455698465069 | 5.947 |
| -0.0469700137195 | 5.552 |
| -0.0483428255071 | 5.974 |
| -0.0486060258541 | 4.43 |
| -0.0491829676141 | 6.141 |
| -0.0501825241476 | 7.857 |
| -0.0504801768226 | 5.573 |
| -0.0515006280731 | 5.676 |
| -0.0518463249446 | 7.122 |
| -0.0525654657021 | 5.386 |
| -0.0546220120331 | 6.21 |
| -0.0549976108336 | 6.586 |
| -0.0554506700114 | 4.584 |
| -0.0559755612375 | 10.014 |
| -0.0559899488308 | 5.215 |
| -0.0568078570331 | 6.223 |
| -0.0574456811301 | 5.827 |
| -0.0581500941429 | 7.028 |
| -0.0581659353703 | 5.919 |
| -0.0586906212735 | 4.808 |
| -0.0622842782543 | 6.747 |
| -0.0628877059554 | 4.296 |
| -0.0630499622007 | 5.424 |
| -0.0643340802356 | 7.346 |
| -0.0647273756256 | 6.734 |
| -0.0649342912109 | 6.113 |
| -0.0653661203827 | 6.547 |
| -0.0661086067039 | 4.44 |
| -0.0664070217252 | 6.936 |
| -0.0664228896457 | 5.001 |
| -0.0684373491864 | 6.513 |
| -0.0687369887824 | 8.281 |
| -0.0690224921275 | 4.8 |
| -0.0691598711814 | 5.843 |
| -0.0693043158142 | 9.302 |
| -0.0693135543225 | 7.078 |
| -0.0697511084424 | 4.237 |
| -0.0702683015048 | 5.084 |
| -0.0703859118581 | 10.687 |
| -0.0705806794456 | 4.398 |
| -0.0706190746935 | 5.914 |
| -0.071471755133 | 5.093 |
| -0.0721683936125 | 6.259 |
| -0.0725146489291 | 9.074 |
| -0.0727899947073 | 8.093 |
| -0.0731242850959 | 12.573 |
| -0.073146003314 | 5.28 |
| -0.0732988147261 | 7.593 |
| -0.0737679565196 | 8.366 |
| -0.0740951869352 | 11.012 |
| -0.074514590549 | 5.495 |
| -0.0751343300608 | 4.216 |
| -0.0764104932883 | 7.479 |
| -0.0765083843607 | 6.331 |
| -0.0767257906428 | 7.743 |
| -0.0776889712527 | 4.578 |
| -0.0786196157129 | 8.102 |
| -0.0800609195821 | 4.392 |
| -0.080170348684 | 5.647 |
| -0.0802354411466 | 10.667 |
| -0.0804824570789 | 4.899 |
| -0.0808867493491 | 4.976 |
| -0.0812875141834 | 5.991 |
| -0.0816008496942 | 4.459 |
| -0.0821469496322 | 12.654 |
| -0.0831613774988 | 4.498 |
| -0.0836073734671 | 9.776 |
| -0.0840224077059 | 5.292 |
| -0.0856645922303 | 4.046 |
| -0.0890982938901 | 11.453 |
| -0.0893092154295 | 4.778 |
| -0.0893178252291 | 4.498 |
| -0.0901224570701 | 5.88 |
| -0.0906793225904 | 6.381 |
| -0.0910287781417 | 7.249 |
| -0.0931877414827 | 7.888 |
| -0.0946984646263 | 11.056 |
| -0.0951572330403 | 4.559 |
| -0.0954273792487 | 4.885 |
| -0.0957314654238 | 5.278 |
| -0.0957589828054 | 4.329 |
| -0.0964362864246 | 8.546 |
| -0.0968399783329 | 5.727 |
| -0.0969529329393 | 3.997 |
| -0.0971778606353 | 9.901 |
| -0.0972347240346 | 5.939 |
| -0.0983566069932 | 5.775 |
| -0.0989418496936 | 4.692 |
| -0.0991129282942 | 5.668 |
| -0.0996458407871 | 8.981 |
| -0.0996860639441 | 5.7 |
| -0.101971973101 | 4.83 |
| -0.102492669212 | 7.127 |
| -0.10256192461 | 9.551 |
| -0.102600962158 | 9.136 |
| -0.102853915586 | 8.442 |
| -0.103612690811 | 4.848 |
| -0.103939551351 | 4.758 |
| -0.103963229403 | 4.65 |
| -0.104153309107 | 5.208 |
| -0.104545261681 | 6.243 |
| -0.105208432608 | 9.514 |
| -0.106396820428 | 6.554 |
| -0.10746743169 | 4.708 |
| -0.107537016522 | 7.266 |
| -0.107911411312 | 6.082 |
| -0.108798497277 | 7.612 |
| -0.11031881783 | 7.902 |
| -0.110783492754 | 6.396 |
| -0.110786185374 | 6.487 |
| -0.110818954041 | 5.822 |
| -0.112034904089 | 6.688 |
| -0.112862852875 | 9.636 |
| -0.113378564643 | 5.727 |
| -0.114082728313 | 6.572 |
| -0.114845334043 | 6.019 |
| -0.11538411329 | 6.62 |
| -0.115983030919 | 6.637 |
| -0.117132633598 | 5.354 |
| -0.117341791103 | 4.907 |
| -0.117844764075 | 7.145 |
| -0.118758362848 | 8.725 |
| -0.11878313497 | 5.056 |
| -0.119002196876 | 4.063 |
| -0.120002223964 | 5.826 |
| -0.120102155027 | 7.224 |
| -0.120706683495 | 10.316 |
| -0.121382649492 | 4.612 |
| -0.121747280799 | 9.758 |
| -0.122570867463 | 4.967 |
| -0.122792948421 | 4.192 |
| -0.12297207574 | 7.213 |
| -0.123536438143 | 5.1 |
| -0.123680599624 | 10.557 |
| -0.124094649968 | 6.248 |
| -0.125932279165 | 8.892 |
| -0.126044296695 | 9.289 |
| -0.126800673899 | 6.135 |
| -0.127014052183 | 6.579 |
| -0.127327431897 | 5.817 |
| -0.128186206876 | 10.058 |
| -0.128721911717 | 4.968 |
| -0.130383777235 | 4.808 |
| -0.131021029452 | 10.381 |
| -0.131774973376 | 4.964 |
| -0.13197871789 | 8.335 |
| -0.134500487359 | 6.694 |
| -0.137015879655 | 7.984 |
| -0.137836748152 | 6.491 |
| -0.138017537942 | 6.577 |
| -0.138395452706 | 4.901 |
| -0.1391088037 | 6.766 |
| -0.139321654457 | 9.335 |
| -0.139541003579 | 9.129 |
| -0.140090648464 | 7.683 |
| -0.140673236835 | 8.595 |
| -0.140803230958 | 5.542 |
| -0.14082926389 | 6.714 |
| -0.141598784179 | 8.418 |
| -0.141883948466 | 5.362 |
| -0.14349159359 | 4.195 |
| -0.143817567708 | 9.871 |
| -0.143900744091 | 6.455 |
| -0.144470304712 | 5.128 |
| -0.144564374376 | 5.007 |
| -0.144834020479 | 5.58 |
| -0.145180811628 | 5.799 |
| -0.145850866463 | 5.658 |
| -0.146169862649 | 6.64 |
| -0.146841388329 | 4.381 |
| -0.147419904379 | 7.367 |
| -0.148355801798 | 4.942 |
| -0.148356118272 | 7.425 |
| -0.148569707534 | 7.12 |
| -0.14935479496 | 8.252 |
| -0.150394932475 | 8.024 |
| -0.150695529962 | 5.896 |
| -0.151949320731 | 6.811 |
| -0.151982104439 | 10.18 |
| -0.152221006751 | 5.355 |
| -0.152562809542 | 11.781 |
| -0.152638501974 | 4.795 |
| -0.153167966371 | 6.275 |
| -0.153740233981 | 4.934 |
| -0.154097523985 | 8.112 |
| -0.154500345739 | 7.208 |
| -0.155138943656 | 5.449 |
| -0.155513154842 | 5.624 |
| -0.155751214403 | 4.735 |
| -0.155759310918 | 5.737 |
| -0.156510148471 | 10.238 |
| -0.157028318744 | 4.682 |
| -0.157134037145 | 5.424 |
| -0.157890694512 | 7.389 |
| -0.158115699153 | 6.949 |
| -0.15907647572 | 5.026 |
| -0.160751464113 | 8.097 |
| -0.16089375041 | 5.882 |
| -0.16112912588 | 4.809 |
| -0.161275419654 | 9.548 |
| -0.162567383226 | 9.646 |
| -0.162950977404 | 6.566 |
| -0.163213861773 | 5.067 |
| -0.163853085548 | 8.414 |
| -0.163948098041 | 9.439 |
| -0.164217808192 | 6.041 |
| -0.16454786971 | 8.376 |
| -0.16505924627 | 4.104 |
| -0.16552851755 | 9.917 |
| -0.166575023564 | 7.133 |
| -0.166860340486 | 8.042 |
| -0.167207117958 | 7.148 |
| -0.168673662395 | 5.664 |
| -0.169094195176 | 6.722 |
| -0.169654656639 | 5.202 |
| -0.169886268151 | 8.777 |
| -0.169925001442 | 4.693 |
| -0.17032805817 | 11.779 |
| -0.170921921548 | 7.287 |
| -0.17107489792 | 8.085 |
| -0.172090571258 | 8.711 |
| -0.173078221402 | 10.827 |
| -0.173425572188 | 4.128 |
| -0.173758618596 | 4.631 |
| -0.174167333962 | 7.236 |
| -0.174172459259 | 9.484 |
| -0.176013126979 | 7.977 |
| -0.176357264891 | 9.106 |
| -0.176620270764 | 9.263 |
| -0.17667433044 | 7.89 |
| -0.176980152508 | 6.977 |
| -0.177062019066 | 9.746 |
| -0.177146228736 | 4.668 |
| -0.178256169829 | 5.925 |
| -0.180919805236 | 9.093 |
| -0.181926729995 | 6.573 |
| -0.182376742489 | 4.529 |
| -0.182703786252 | 10.275 |
| -0.182726283665 | 4.951 |
| -0.182877386208 | 9.95 |
| -0.184767349037 | 4.971 |
| -0.185525970211 | 4.08 |
| -0.187169947876 | 4.567 |
| -0.187781666023 | 5.245 |
| -0.188112818901 | 8.694 |
| -0.18854067961 | 9.848 |
| -0.188617577768 | 9.595 |
| -0.188640925938 | 6.424 |
| -0.188754123916 | 7.266 |
| -0.188943221209 | 6.017 |
| -0.18903382439 | 4.494 |
| -0.189139322025 | 9.228 |
| -0.190532730057 | 8.46 |
| -0.190708326181 | 10.029 |
| -0.191131673133 | 4.458 |
| -0.191331442575 | 7.615 |
| -0.192201921729 | 4.039 |
| -0.192578935266 | 9.326 |
| -0.193249788036 | 6.912 |
| -0.193253821711 | 7.115 |
| -0.193454444045 | 7.052 |
| -0.194045788637 | 5.684 |
| -0.196559817205 | 10.076 |
| -0.196749629252 | 8.749 |
| -0.197764048567 | 7.981 |
| -0.198168939069 | 9.432 |
| -0.199247121971 | 10.321 |
| -0.199913078406 | 5.449 |
| -0.199957060023 | 8.128 |
| -0.200394577547 | 4.52 |
| -0.200635682548 | 5.255 |
| -0.200656234226 | 6.599 |
| -0.201300933373 | 5.8 |
| -0.201600442631 | 6.317 |
| -0.20163386117 | 4.752 |
| -0.202248844227 | 7.41 |
| -0.202431853957 | 12.105 |
| -0.202530317851 | 8.791 |
| -0.202623129111 | 6.127 |
| -0.20333918327 | 6.516 |
| -0.205211749511 | 5.227 |
| -0.205422601108 | 6.454 |
| -0.207013130746 | 7.04 |
| -0.207107692886 | 4.933 |
| -0.207275218335 | 7.847 |
| -0.208725623395 | 6.952 |
| -0.208842019211 | 6.42 |
| -0.208875478563 | 8.554 |
| -0.209102014259 | 9.908 |
| -0.20918360496 | 4.758 |
| -0.209584940364 | 4.183 |
| -0.210773099954 | 5.624 |
| -0.211276783829 | 6.429 |
| -0.211545530403 | 5.051 |
| -0.212113926699 | 10.167 |
| -0.213206552816 | 7.907 |
| -0.213595473099 | 6.13 |
| -0.21384764806 | 9.412 |
| -0.216107984039 | 4.953 |
| -0.216126111608 | 7.202 |
| -0.217594771166 | 7.54 |
| -0.217665978811 | 11.131 |
| -0.21784429424 | 8.784 |
| -0.218139611417 | 13.931 |
| -0.218938930661 | 4.908 |
| -0.219125595429 | 6.665 |
| -0.220342264617 | 4.985 |
| -0.22042203405 | 8.905 |
| -0.220571174617 | 5.346 |
| -0.220831907349 | 4.25 |
| -0.221193671753 | 4.848 |
| -0.222804286508 | 7.601 |
| -0.22556274546 | 7.069 |
| -0.22645489902 | 5.997 |
| -0.229140727648 | 9.271 |
| -0.229161244483 | 9.309 |
| -0.230171460615 | 7.41 |
| -0.230322968329 | 5.306 |
| -0.230940970018 | 7.778 |
| -0.231902640619 | 6.609 |
| -0.232206592367 | 6.987 |
| -0.232349267977 | 4.193 |
| -0.232707086211 | 11.7 |
| -0.233435835975 | 6.524 |
| -0.235793757808 | 4.644 |
| -0.237096194912 | 5.019 |
| -0.238393204947 | 6.746 |
| -0.238797919001 | 6.576 |
| -0.239058863764 | 8.042 |
| -0.240609473471 | 9.656 |
| -0.240655376702 | 11.408 |
| -0.241924725305 | 6.338 |
| -0.242438596774 | 5.946 |
| -0.242465708496 | 6.068 |
| -0.242985942604 | 5.057 |
| -0.243377446466 | 10.502 |
| -0.243880440122 | 6.259 |
| -0.244138918107 | 7.062 |
| -0.246379462629 | 6.388 |
| -0.246496367983 | 10.132 |
| -0.246591643376 | 5.78 |
| -0.247644110779 | 10.789 |
| -0.247746281732 | 8.098 |
| -0.248842337616 | 7.154 |
| -0.249622494469 | 5.057 |
| -0.250895422888 | 11.076 |
| -0.251901663499 | 7.839 |
| -0.252694073023 | 6.541 |
| -0.253553928111 | 8.65 |
| -0.253687233575 | 6.447 |
| -0.253771004856 | 6.125 |
| -0.254157416785 | 7.607 |
| -0.254549052681 | 6.598 |
| -0.25481101551 | 7.701 |
| -0.255616934271 | 5.981 |
| -0.256257719027 | 4.083 |
| -0.256445588644 | 6.366 |
| -0.257531430156 | 4.027 |
| -0.25899848941 | 8.516 |
| -0.260424242217 | 8.771 |
| -0.260527550223 | 5.365 |
| -0.260700891308 | 6.487 |
| -0.261181415851 | 5.174 |
| -0.2626741952 | 8.68 |
| -0.262773848602 | 14.085 |
| -0.262906114958 | 7.945 |
| -0.263061334597 | 7.611 |
| -0.264980925186 | 4.552 |
| -0.267709770437 | 6.502 |
| -0.267836844963 | 6.164 |
| -0.268002213356 | 6.115 |
| -0.268904993958 | 6.535 |
| -0.269708837052 | 6.569 |
| -0.270808532638 | 5.434 |
| -0.271804615462 | 4.896 |
| -0.272624303566 | 7.353 |
| -0.273221631145 | 8.102 |
| -0.273737745914 | 6.663 |
| -0.276437110436 | 6.09 |
| -0.278805730242 | 4.8 |
| -0.279452165268 | 4.632 |
| -0.279827243627 | 9.696 |
| -0.28043303357 | 5.673 |
| -0.281170172399 | 6.833 |
| -0.281325554691 | 7.289 |
| -0.281537726762 | 5.574 |
| -0.281817881513 | 4.391 |
| -0.284308122243 | 5.644 |
| -0.284498915022 | 5.666 |
| -0.284572820338 | 6.805 |
| -0.285417473289 | 7.743 |
| -0.28625119263 | 5.565 |
| -0.286392839189 | 13.346 |
| -0.286427224263 | 6.167 |
| -0.289457123136 | 9.966 |
| -0.289806161461 | 5.574 |
| -0.291559506946 | 7.33 |
| -0.292086083358 | 5.04 |
| -0.292796537076 | 5.436 |
| -0.292902981653 | 7.179 |
| -0.292986136617 | 6.184 |
| -0.293217731887 | 5.069 |
| -0.29479606415 | 4.236 |
| -0.295237517878 | 5.215 |
| -0.295931157799 | 7.068 |
| -0.298285253017 | 7.349 |
| -0.299020788537 | 4.418 |
| -0.300766851337 | 7.753 |
| -0.301032870576 | 7.519 |
| -0.302121061936 | 7.673 |
| -0.304398909046 | 8.805 |
| -0.304902281429 | 9.961 |
| -0.30516106891 | 7.603 |
| -0.305810341312 | 7.559 |
| -0.306120510746 | 5.744 |
| -0.308342644979 | 4.764 |
| -0.308516334378 | 6.772 |
| -0.309122404934 | 7.645 |
| -0.30972269999 | 6.953 |
| -0.309840812589 | 5.193 |
| -0.310653176359 | 5.512 |
| -0.311280626814 | 7.734 |
| -0.311433658263 | 4.452 |
| -0.312765534422 | 6.802 |
| -0.31277476474 | 5.401 |
| -0.313305029596 | 5.389 |
| -0.313390499946 | 9.299 |
| -0.31416333595 | 10.004 |
| -0.314185824288 | 8.089 |
| -0.316379478731 | 9.839 |
| -0.317306916726 | 7.992 |
| -0.318437420451 | 9.121 |
| -0.318580218269 | 5.736 |
| -0.318881804198 | 4.488 |
| -0.319423104729 | 4.099 |
| -0.319552909334 | 7.396 |
| -0.319973165673 | 7.246 |
| -0.32111781964 | 5.288 |
| -0.321578699215 | 7.91 |
| -0.3234657255 | 6.924 |
| -0.324514360274 | 10.984 |
| -0.324856576475 | 4.909 |
| -0.326360341203 | 4.286 |
| -0.326376231402 | 5.949 |
| -0.32782461011 | 8.368 |
| -0.328212877477 | 6.238 |
| -0.328978355586 | 5.371 |
| -0.329234571088 | 9.541 |
| -0.329539230949 | 8.23 |
| -0.329776463152 | 11.446 |
| -0.330735880141 | 8.826 |
| -0.332375173281 | 8.009 |
| -0.333201331171 | 7.477 |
| -0.333248273136 | 7.703 |
| -0.333978992621 | 12.474 |
| -0.334595301115 | 5.818 |
| -0.33499446679 | 9.236 |
| -0.33518419159 | 4.179 |
| -0.335295854812 | 4.957 |
| -0.33572923138 | 10.724 |
| -0.33704586729 | 7.96 |
| -0.337990032445 | 9.528 |
| -0.338069294861 | 5.726 |
| -0.338842287192 | 4.155 |
| -0.34150612992 | 9.56 |
| -0.341751449342 | 10.812 |
| -0.341976883899 | 9.805 |
| -0.343102625523 | 7.672 |
| -0.343124886742 | 6.391 |
| -0.345091543575 | 10.571 |
| -0.345228346655 | 6.35 |
| -0.34591723815 | 5.586 |
| -0.346195510549 | 7.621 |
| -0.346421415418 | 6.457 |
| -0.346584375212 | 5.228 |
| -0.347419399936 | 5.893 |
| -0.347481104817 | 7.72 |
| -0.348130077189 | 5.044 |
| -0.349009958127 | 7.857 |
| -0.350068846146 | 11.579 |
| -0.350081185065 | 5.928 |
| -0.350325098043 | 4.422 |
| -0.351697274524 | 5.761 |
| -0.353156004116 | 10.641 |
| -0.353818485721 | 8.928 |
| -0.353972348093 | 4.004 |
| -0.354750574925 | 4.833 |
| -0.355964418887 | 5.061 |
| -0.356157108036 | 7.851 |
| -0.356579641542 | 5.601 |
| -0.357343778445 | 4.899 |
| -0.358678035885 | 9.341 |
| -0.358686644897 | 5.869 |
| -0.360989519898 | 6.519 |
| -0.362247075904 | 5.046 |
| -0.36407141314 | 15.34 |
| -0.364305130755 | 5.438 |
| -0.364534780368 | 11.918 |
| -0.364646425101 | 10.403 |
| -0.366022144319 | 6.217 |
| -0.36655235735 | 7.297 |
| -0.366814414684 | 5.955 |
| -0.367595845775 | 4.107 |
| -0.368084095763 | 6.382 |
| -0.368464861265 | 4.09 |
| -0.369062070478 | 4.14 |
| -0.369924990782 | 9.457 |
| -0.371177840593 | 4.783 |
| -0.37161143992 | 6.761 |
| -0.371934913294 | 6.457 |
| -0.371968777387 | 4.629 |
| -0.372455653495 | 4.133 |
| -0.372739080213 | 11.973 |
| -0.372977419964 | 7.614 |
| -0.373269968042 | 4.129 |
| -0.374476415081 | 4.485 |
| -0.374743233466 | 8.112 |
| -0.375601212045 | 7.758 |
| -0.375715455442 | 4.254 |
| -0.375924260487 | 8.725 |
| -0.37706021967 | 5.095 |
| -0.377438588589 | 7.263 |
| -0.377541285152 | 6.13 |
| -0.378136430067 | 6.841 |
| -0.378271220825 | 7.306 |
| -0.378857227605 | 8.714 |
| -0.379248259368 | 8.557 |
| -0.379397229934 | 13.249 |
| -0.379436131482 | 5.761 |
| -0.379551370927 | 6.806 |
| -0.37957650469 | 5.313 |
| -0.380414636188 | 7.169 |
| -0.381870635344 | 4.23 |
| -0.382598954288 | 6.256 |
| -0.384848751875 | 7.387 |
| -0.386248225096 | 11.092 |
| -0.386717823131 | 6.364 |
| -0.387908846072 | 8.398 |
| -0.388004826606 | 7.156 |
| -0.388191770432 | 4.781 |
| -0.389665896502 | 8.749 |
| -0.389988010243 | 4.332 |
| -0.390547244592 | 6.412 |
| -0.391139231581 | 6.911 |
| -0.391181726907 | 7.103 |
| -0.391338439003 | 8.643 |
| -0.391588326269 | 13.394 |
| -0.393405182041 | 9.036 |
| -0.394168631487 | 4.228 |
| -0.394915646051 | 11.902 |
| -0.395802164825 | 5.963 |
| -0.396285785865 | 7.597 |
| -0.397528849424 | 4.187 |
| -0.399226984431 | 6.394 |
| -0.399995559505 | 5.734 |
| -0.400335784497 | 7.448 |
| -0.401221391577 | 7.48 |
| -0.401320356202 | 8.452 |
| -0.402467104854 | 8.059 |
| -0.402672505163 | 5.074 |
| -0.40269830815 | 7.9 |
| -0.404615178303 | 8.801 |
| -0.405681934229 | 7.446 |
| -0.405728292973 | 9.702 |
| -0.406327800306 | 6.324 |
| -0.407885313748 | 6.019 |
| -0.408515779883 | 8.076 |
| -0.408542786507 | 5.703 |
| -0.408854109548 | 5.456 |
| -0.409236793256 | 12.946 |
| -0.409425080907 | 8.172 |
| -0.409628062717 | 4.481 |
| -0.41012092811900003 | 5.702 |
| -0.411235929119 | 4.242 |
| -0.411256384994 | 7.968 |
| -0.411682092894 | 4.982 |
| -0.413277041414 | 4.517 |
| -0.413554008104 | 4.439 |
| -0.413593805081 | 9.507 |
| -0.413649625155 | 4.103 |
| -0.41390641726 | 6.198 |
| -0.413908541524 | 5.181 |
| -0.41467478525 | 7.111 |
| -0.414864088011 | 5.571 |
| -0.415780964918 | 5.469 |
| -0.415986209825 | 9.124 |
| -0.416079806339 | 6.456 |
| -0.41617374809 | 6.191 |
| -0.416424524291 | 7.638 |
| -0.417186838804 | 6.412 |
| -0.419937249409 | 5.886 |
| -0.420394241415 | 5.712 |
| -0.420769310715 | 6.445 |
| -0.421432119631 | 6.131 |
| -0.422455773797 | 8.333 |
| -0.422843984729 | 6.111 |
| -0.42400089747 | 6.942 |
| -0.424038745371 | 5.63 |
| -0.426363141516 | 4.953 |
| -0.427670693721 | 6.996 |
| -0.428116197032 | 6.324 |
| -0.431241519478 | 9.098 |
| -0.431417783753 | 6.789 |
| -0.431594634827 | 5.401 |
| -0.432841967002 | 5.713 |
| -0.433948181413 | 5.875 |
| -0.433975747608 | 4.409 |
| -0.435506400992 | 7.954 |
| -0.436434508285 | 6.206 |
| -0.436554890748 | 9.532 |
| -0.437381420497 | 4.383 |
| -0.438511740575 | 6.318 |
| -0.438900762786 | 6.054 |
| -0.439608197335 | 8.709 |
| -0.441482913339 | 8.047 |
| -0.441554350553 | 6.093 |
| -0.442385614265 | 8.461 |
| -0.443587947397 | 12.637 |
| -0.444753500246 | 7.787 |
| -0.445001233547 | 5.908 |
| -0.445948389274 | 5.309 |
| -0.446051186733 | 4.725 |
| -0.446140552267 | 8.313 |
| -0.446821415626 | 4.958 |
| -0.447240948402 | 8.284 |
| -0.449030540352 | 4.032 |
| -0.449218525186 | 10.724 |
| -0.449954989775 | 4.251 |
| -0.451055715307 | 7.53 |
| -0.451988635452 | 5.692 |
| -0.452808767951 | 7.695 |
| -0.453063772221 | 8.028 |
| -0.453952969944 | 6.188 |
| -0.454549941876 | 5.834 |
| -0.455781042461 | 9.409 |
| -0.456650871565 | 7.403 |
| -0.457620206018 | 8.617 |
| -0.458064782873 | 5.148 |
| -0.458433904185 | 5.613 |
| -0.461775075626 | 6.371 |
| -0.462394370476 | 7.233 |
| -0.464610560356 | 7.269 |
| -0.465351050406 | 6.551 |
| -0.466299026262 | 7.097 |
| -0.466773476361 | 8.656 |
| -0.467527379688 | 5.746 |
| -0.468148835738 | 6.692 |
| -0.468448491995 | 8.786 |
| -0.468944591023 | 6.048 |
| -0.470890734012 | 4.553 |
| -0.47170822853 | 7.941 |
| -0.472336044582 | 6.927 |
| -0.472731667115 | 6.134 |
| -0.474027164852 | 7.838 |
| -0.474531099498 | 10.423 |
| -0.475295941396 | 13.179 |
| -0.475561582676 | 4.704 |
| -0.475910671815 | 7.968 |
| -0.475916292449 | 6.351 |
| -0.476526268682 | 5.581 |
| -0.477981472918 | 6.736 |
| -0.481055434629 | 5.138 |
| -0.48172066651 | 11.962 |
| -0.482399134473 | 5.812 |
| -0.483130372673 | 8.02 |
| -0.483647833771 | 7.49 |
| -0.484534153169 | 9.111 |
| -0.484657594925 | 4.961 |
| -0.48503317253 | 7.644 |
| -0.486657080003 | 5.434 |
| -0.486816840806 | 6.459 |
| -0.489490295507 | 5.461 |
| -0.491538195256 | 6.563 |
| -0.491687545232 | 7.799 |
| -0.491757959989 | 8.014 |
| -0.492444485984 | 5.678 |
| -0.494090411393 | 7.533 |
| -0.494365408747 | 5.26 |
| -0.494544113041 | 5.779 |
| -0.495000211367 | 6.823 |
| -0.498313959341 | 7.232 |
| -0.498362691966 | 9.081 |
| -0.49911832443 | 7.107 |
| -0.49928481289 | 6.251 |
| -0.501416558051 | 4.003 |
| -0.501456936989 | 4.366 |
| -0.502313813276 | 6.022 |
| -0.502747737433 | 5.607 |
| -0.504275875613 | 10.567 |
| -0.505809567482 | 8.762 |
| -0.505999152826 | 5.144 |
| -0.50650288305 | 6.002 |
| -0.507575446705 | 6.967 |
| -0.508784820269 | 6.112 |
| -0.511387743887 | 12.159 |
| -0.511419264357 | 6.998 |
| -0.512107668203 | 4.986 |
| -0.512618290134 | 11.329 |
| -0.513688264783 | 5.539 |
| -0.513798057355 | 6.245 |
| -0.513887792202 | 9.27 |
| -0.514824229133 | 6.104 |
| -0.517431882565 | 4.829 |
| -0.51766070667 | 5.232 |
| -0.518016676811 | 7.175 |
| -0.52161173341 | 7.719 |
| -0.522944111526 | 4.713 |
| -0.524911229129 | 9.305 |
| -0.527050267251 | 4.995 |
| -0.527110638805 | 6.077 |
| -0.527873654751 | 7.456 |
| -0.527931555685 | 6.729 |
| -0.527975877432 | 4.623 |
| -0.529255252291 | 7.984 |
| -0.53029095632 | 6.165 |
| -0.530843012306 | 5.602 |
| -0.531136729057 | 10.991 |
| -0.532188648566 | 8.576 |
| -0.533295852659 | 8.339 |
| -0.533594328182 | 8.424 |
| -0.533787062963 | 5.278 |
| -0.534271737158 | 8.017 |
| -0.535520420365 | 5.926 |
| -0.535523567987 | 6.509 |
| -0.537174601767 | 5.766 |
| -0.538109300411 | 6.203 |
| -0.538546855986 | 6.702 |
| -0.539158811108 | 5.912 |
| -0.541516671366 | 7.424 |
| -0.542386614458 | 8.383 |
| -0.543232280339 | 11.95 |
| -0.544170618043 | 5.534 |
| -0.546836575953 | 5.489 |
| -0.546848189139 | 10.609 |
| -0.549281746094 | 5.346 |
| -0.549905149162 | 8.024 |
| -0.551114730237 | 7.957 |
| -0.552259549017 | 4.021 |
| -0.555010598967 | 5.952 |
| -0.556464566986 | 7.776 |
| -0.557505537998 | 6.838 |
| -0.55772226701 | 8.698 |
| -0.558214957882 | 8.196 |
| -0.558572365596 | 5.719 |
| -0.560714954474 | 5.233 |
| -0.562797755473 | 4.513 |
| -0.56492025759 | 6.787 |
| -0.565031967212 | 7.41 |
| -0.568387636356 | 8.459 |
| -0.569646630209 | 6.26 |
| -0.572279409193 | 10.133 |
| -0.572301961293 | 6.638 |
| -0.574440695019 | 5.444 |
| -0.575301490479 | 12.832 |
| -0.576647232509 | 6.155 |
| -0.577713533645 | 10.043 |
| -0.578265457618 | 6.108 |
| -0.579652952214 | 7.278 |
| -0.579937872078 | 5.22 |
| -0.579999650421 | 9.186 |
| -0.583118075478 | 7.984 |
| -0.583242899067 | 6.881 |
| -0.584387836288 | 6.369 |
| -0.584391927235 | 4.327 |
| -0.584885320299 | 7.274 |
| -0.586158269576 | 6.637 |
| -0.590876125754 | 5.697 |
| -0.592475524628 | 6.915 |
| -0.592558505698 | 6.454 |
| -0.593167423543 | 4.666 |
| -0.594166915258 | 6.008 |
| -0.594521329146 | 4.055 |
| -0.595439324385 | 5.788 |
| -0.596165118098 | 7.619 |
| -0.596539442464 | 5.915 |
| -0.596617342278 | 7.012 |
| -0.597032807823 | 7.308 |
| -0.597054607376 | 5.947 |
| -0.597855303602 | 6.109 |
| -0.598483640375 | 5.711 |
| -0.599259063867 | 8.099 |
| -0.600213708032 | 7.886 |
| -0.600458837044 | 4.479 |
| -0.601219255529 | 6.276 |
| -0.601568421779 | 5.359 |
| -0.601722592584 | 6.54 |
| -0.603518319749 | 4.914 |
| -0.603964411833 | 6.141 |
| -0.604629534177 | 5.882 |
| -0.605616588828 | 8.771 |
| -0.605911440281 | 6.237 |
| -0.608457012282 | 4.395 |
| -0.608913427188 | 4.79 |
| -0.609336888002 | 9.002 |
| -0.610315260746 | 8.815 |
| -0.61124182552 | 7.093 |
| -0.613666996512 | 5.697 |
| -0.613730027587 | 9.134 |
| -0.614228847783 | 8.798 |
| -0.615765407495 | 11.88 |
| -0.617367042292 | 4.953 |
| -0.61762930222 | 8.209 |
| -0.618621812072 | 4.5 |
| -0.619066166427 | 5.739 |
| -0.619404017993 | 5.394 |
| -0.621881663421 | 11.213 |
| -0.622033372676 | 4.26 |
| -0.622284126927 | 4.122 |
| -0.62753812278 | 6.016 |
| -0.627869751602 | 6.042 |
| -0.628905848309 | 4.23 |
| -0.631341581792 | 9.158 |
| -0.632128978443 | 10.517 |
| -0.633087548105 | 7.912 |
| -0.633206910487 | 7.808 |
| -0.634350527683 | 6.783 |
| -0.636290800903 | 4.741 |
| -0.636827275366 | 7.117 |
| -0.637006503248 | 6.711 |
| -0.638224684465 | 4.673 |
| -0.639741561938 | 5.281 |
| -0.642643031358 | 4.302 |
| -0.643326663235 | 5.023 |
| -0.644194231025 | 5.804 |
| -0.645649569172 | 7.93 |
| -0.645666159015 | 7.821 |
| -0.647012219271 | 9.308 |
| -0.648126084882 | 5.087 |
| -0.654018502782 | 9.116 |
| -0.654671472533 | 5.248 |
| -0.656405743632 | 10.399 |
| -0.65682386182 | 8.056 |
| -0.656962224584 | 4.534 |
| -0.658480794019 | 14.288 |
| -0.659572611533 | 5.64 |
| -0.660182272224 | 6.968 |
| -0.660488613703 | 6.918 |
| -0.663028594739 | 8.264 |
| -0.663216892353 | 8.166 |
| -0.663955101431 | 10.319 |
| -0.668421735079 | 5.571 |
| -0.669323593771 | 5.146 |
| -0.671226364198 | 6.762 |
| -0.671327175479 | 5.676 |
| -0.672207651686 | 11.446 |
| -0.674198745273 | 8.702 |
| -0.675366569312 | 4.916 |
| -0.677637623468 | 10.001 |
| -0.678831703895 | 5.399 |
| -0.679166652888 | 5.983 |
| -0.682667899192 | 8.09 |
| -0.682797156287 | 5.574 |
| -0.683432790381 | 4.443 |
| -0.683870324096 | 7.969 |
| -0.683953370629 | 14.055 |
| -0.684609103882 | 5.889 |
| -0.687166627828 | 6.554 |
| -0.68761749234 | 7.827 |
| -0.687866392413 | 6.077 |
| -0.69145435378 | 5.373 |
| -0.693007848496 | 4.702 |
| -0.694405131938 | 6.056 |
| -0.694558198592 | 6.862 |
| -0.697702292266 | 6.319 |
| -0.699142247085 | 4.927 |
| -0.699876275431 | 5.804 |
| -0.701205831049 | 5.352 |
| -0.703140154239 | 9.319 |
| -0.705529294269 | 8.458 |
| -0.705742155013 | 4.869 |
| -0.706268796943 | 5.476 |
| -0.706304512963 | 5.057 |
| -0.706622390004 | 8.358 |
| -0.70681276016 | 6.859 |
| -0.707050866419 | 7.99 |
| -0.709703514162 | 6.931 |
| -0.710308800532 | 5.485 |
| -0.714898637778 | 8.993 |
| -0.715806850993 | 7.128 |
| -0.715871163352 | 6.457 |
| -0.716080819482 | 6.507 |
| -0.718873753873 | 5.08 |
| -0.719371534151 | 5.355 |
| -0.719941623056 | 4.73 |
| -0.72077053122 | 5.051 |
| -0.721558351726 | 7.676 |
| -0.722400478707 | 6.123 |
| -0.723710947347 | 8.186 |
| -0.72452456709 | 4.605 |
| -0.724606351838 | 6.91 |
| -0.724631797416 | 8.358 |
| -0.724825827321 | 11.579 |
| -0.725535649648 | 6.932 |
| -0.727482973412 | 6.408 |
| -0.72808744282 | 6.182 |
| -0.728645307323 | 9.48 |
| -0.729114273038 | 6.698 |
| -0.73066685606 | 5.72 |
| -0.733818228754 | 8.617 |
| -0.733886201234 | 6.628 |
| -0.734353153144 | 8.254 |
| -0.734877822956 | 6.388 |
| -0.735589804276 | 8.588 |
| -0.73978402318 | 8.626 |
| -0.740283389359 | 9.957 |
| -0.740536066606 | 9.094 |
| -0.741312644698 | 5.654 |
| -0.742640567111 | 5.841 |
| -0.744673689301 | 4.086 |
| -0.744851820946 | 5.287 |
| -0.745971913175 | 6.075 |
| -0.7466157642 | 4.95 |
| -0.747645680257 | 6.684 |
| -0.749148875923 | 6.072 |
| -0.749345350208 | 7.219 |
| -0.750177980549 | 7.378 |
| -0.750218519661 | 5.178 |
| -0.75093043261 | 7.638 |
| -0.753130413597 | 4.014 |
| -0.754164646546 | 7.804 |
| -0.756099050449 | 12.031 |
| -0.758786529781 | 6.999 |
| -0.760633855881 | 8.06 |
| -0.764206832753 | 5.76 |
| -0.765218053344 | 4.804 |
| -0.768555115754 | 6.27 |
| -0.77069828061 | 5.454 |
| -0.770905461988 | 4.544 |
| -0.772898735698 | 9.005 |
| -0.775633537251 | 4.845 |
| -0.777014844901 | 8.01 |
| -0.779374504838 | 6.85 |
| -0.779920345441 | 8.834 |
| -0.780932438224 | 5.017 |
| -0.782866444775 | 7.822 |
| -0.783004237626 | 8.554 |
| -0.787629497999 | 5.393 |
| -0.789180679717 | 4.334 |
| -0.792910726575 | 5.21 |
| -0.792984376508 | 5.86 |
| -0.795021224062 | 11.191 |
| -0.796116196236 | 4.894 |
| -0.796205725158 | 7.187 |
| -0.797374182402 | 9.131 |
| -0.79839508507 | 5.05 |
| -0.799043819313 | 5.947 |
| -0.79917530863 | 8.494 |
| -0.800200148907 | 8.209 |
| -0.80225261055 | 6.282 |
| -0.802882286003 | 5.35 |
| -0.804504718101 | 6.759 |
| -0.80684172052 | 5.006 |
| -0.809416114281 | 6.655 |
| -0.811739007235 | 5.381 |
| -0.812188280758 | 6.519 |
| -0.816792265575 | 7.192 |
| -0.817241679336 | 5.313 |
| -0.817375724632 | 6.052 |
| -0.817789402094 | 7.297 |
| -0.820880287129 | 5.296 |
| -0.822087742834 | 8.884 |
| -0.822992203301 | 6.04 |
| -0.829654125616 | 8.614 |
| -0.829891391171 | 6.757 |
| -0.829916147752 | 12.852 |
| -0.830359952842 | 5.425 |
| -0.831253189755 | 5.22 |
| -0.831654056691 | 6.036 |
| -0.834532008506 | 8.72 |
| -0.844025057019 | 7.415 |
| -0.850571368801 | 6.743 |
| -0.850861042679 | 6.465 |
| -0.851203566039 | 8.102 |
| -0.852275919916 | 5.026 |
| -0.853451336647 | 4.408 |
| -0.858124354301 | 4.211 |
| -0.859924658935 | 4.973 |
| -0.864822454766 | 6.125 |
| -0.865830938584 | 5.464 |
| -0.866005470816 | 6.97 |
| -0.868034659791 | 4.77 |
| -0.868799057284 | 4.411 |
| -0.869513682501 | 5.918 |
| -0.869957789731 | 7.383 |
| -0.870613575175 | 8.75 |
| -0.870660051161 | 11.816 |
| -0.87085009961 | 6.638 |
| -0.872342816808 | 5.227 |
| -0.872972287375 | 7.056 |
| -0.873253350461 | 5.275 |
| -0.879654223972 | 7.425 |
| -0.881761988573 | 6.029 |
| -0.882406111646 | 6.788 |
| -0.88669799683 | 5.757 |
| -0.887576681072 | 7.232 |
| -0.891955082878 | 6.936 |
| -0.893566698398 | 4.662 |
| -0.895826482541 | 5.537 |
| -0.895925120615 | 7.055 |
| -0.90087556903 | 5.267 |
| -0.9026022569 | 6.045 |
| -0.903608623711 | 7.259 |
| -0.904652123413 | 5.172 |
| -0.906033359688 | 5.355 |
| -0.9071138272 | 9.41 |
| -0.909577349597 | 9.202 |
| -0.909899345481 | 4.732 |
| -0.915906715609 | 8.16 |
| -0.9207274390969999 | 9.291 |
| -0.920876656492 | 7.708 |
| -0.9240147734 | 7.534 |
| -0.924705325528 | 10.787 |
| -0.925761369708 | 5.5 |
| -0.927827650981 | 8.569 |
| -0.930057187512 | 7.103 |
| -0.930972415213 | 4.82 |
| -0.931218988972 | 6.474 |
| -0.933683074548 | 10.62 |
| -0.941785386055 | 4.299 |
| -0.943856921962 | 4.182 |
| -0.944661938232 | 5.536 |
| -0.945491957522 | 8.139 |
| -0.94581011244 | 7.504 |
| -0.947836145607 | 4.294 |
| -0.948915299791 | 4.097 |
| -0.951060769611 | 5.592 |
| -0.951589041204 | 5.093 |
| -0.95199854946 | 8.338 |
| -0.95487062451 | 5.306 |
| -0.964541744559 | 8.294 |
| -0.966569174942 | 7.574 |
| -0.968895317224 | 4.848 |
| -0.969817859533 | 5.677 |
| -0.973294938096 | 7.825 |
| -0.973914873112 | 6.556 |
| -0.98500278755 | 6.488 |
| -0.992197411804 | 6.36 |
| -0.994942343494 | 5.054 |
| -0.999198280034 | 4.7 |
| -1.0 | 4.326 |
| -1.00216783668 | 4.246 |
| -1.00724064276 | 4.519 |
| -1.00853387659 | 5.482 |
| -1.01002497176 | 8.916 |
| -1.01070871339 | 4.105 |
| -1.01924477235 | 5.036 |
| -1.02065732111 | 8.586 |
| -1.02245485083 | 6.52 |
| -1.02398210369 | 5.174 |
| -1.02494048952 | 5.38 |
| -1.02722758491 | 7.055 |
| -1.03250378572 | 6.553 |
| -1.03584025154 | 5.743 |
| -1.0361596633 | 4.09 |
| -1.03643168611 | 14.377 |
| -1.03758318281 | 4.309 |
| -1.04123703299 | 4.366 |
| -1.04356901494 | 4.207 |
| -1.04887464089 | 6.708 |
| -1.05229580328 | 6.778 |
| -1.05341820679 | 4.183 |
| -1.05830546417 | 9.179 |
| -1.0603985766 | 10.526 |
| -1.06086713041 | 4.545 |
| -1.06456041494 | 6.682 |
| -1.06492878081 | 4.934 |
| -1.06514169045 | 4.328 |
| -1.06811018833 | 4.421 |
| -1.06940906963 | 7.921 |
| -1.06969024867 | 8.917 |
| -1.0754407563 | 4.578 |
| -1.07736696351 | 4.413 |
| -1.07815742039 | 6.725 |
| -1.08352823269 | 7.162 |
| -1.09756477838 | 4.733 |
| -1.10432145763 | 7.109 |
| -1.10791533917 | 5.577 |
| -1.10959200987 | 6.667 |
| -1.1107119363 | 8.454 |
| -1.11771252293 | 5.136 |
| -1.11838122831 | 4.291 |
| -1.11886184077 | 5.837 |
| -1.12374930555 | 4.429 |
| -1.12616990923 | 8.291 |
| -1.12889773318 | 4.515 |
| -1.12903734729 | 4.686 |
| -1.14448268119 | 7.146 |
| -1.14556634814 | 11.721 |
| -1.1468768864 | 5.362 |
| -1.14792297862 | 7.871 |
| -1.15355393261 | 6.999 |
| -1.157433756 | 8.219 |
| -1.15754677279 | 8.187 |
| -1.1655113994 | 7.229 |
| -1.16558606572 | 4.087 |
| -1.17081363408 | 4.052 |
| -1.17553522054 | 4.698 |
| -1.17618290594 | 4.31 |
| -1.17883605535 | 4.663 |
| -1.18368317955 | 8.239 |
| -1.19366573242 | 6.522 |
| -1.19645563215 | 4.836 |
| -1.19717067667 | 6.993 |
| -1.19854567938 | 4.531 |
| -1.202816883 | 5.16 |
| -1.21277532728 | 7.453 |
| -1.21450266317 | 6.396 |
| -1.21456304808 | 5.197 |
| -1.22486226151 | 4.41 |
| -1.22677086185 | 4.279 |
| -1.23461726404 | 10.811 |
| -1.23781024712 | 5.136 |
| -1.24099476412 | 11.713 |
| -1.24130607233 | 4.922 |
| -1.25691971613 | 8.243 |
| -1.25748438601 | 4.238 |
| -1.25811735698 | 7.737 |
| -1.2589913531 | 5.475 |
| -1.25925428969 | 4.76 |
| -1.25941493288 | 7.768 |
| -1.26107445702 | 6.127 |
| -1.26492672641 | 6.933 |
| -1.27824785392 | 5.31 |
| -1.27991600426 | 13.605 |
| -1.28484881556 | 10.182 |
| -1.28619582416 | 5.98 |
| -1.28888783312 | 4.385 |
| -1.29067523539 | 8.554 |
| -1.29137530898 | 5.672 |
| -1.30196188592 | 10.8 |
| -1.30964187342 | 6.426 |
| -1.31302254167 | 5.139 |
| -1.32470394648 | 6.549 |
| -1.32518815119 | 6.369 |
| -1.32630274207 | 5.57 |
| -1.32978486061 | 5.328 |
| -1.33917726096 | 4.599 |
| -1.34534475932 | 4.483 |
| -1.34564753985 | 4.995 |
| -1.36272030535 | 6.824 |
| -1.36589321884 | 4.167 |
| -1.3717071431 | 4.699 |
| -1.38112589841 | 4.643 |
| -1.38877995871 | 4.605 |
| -1.39375273033 | 7.683 |
| -1.39755007255 | 4.709 |
| -1.40707621358 | 4.037 |
| -1.41627554539 | 4.684 |
| -1.41835277084 | 4.084 |
| -1.4270448007 | 5.637 |
| -1.42708454214 | 6.128 |
| -1.42821582343 | 5.33 |
| -1.42859953398 | 5.786 |
| -1.44615620828 | 5.862 |
| -1.44822616393 | 8.013 |
| -1.45014762872 | 4.891 |
| -1.45816219925 | 5.379 |
| -1.46171155059 | 5.727 |
| -1.46294667367 | 5.358 |
| -1.46453606733 | 8.152 |
| -1.4796335477 | 4.457 |
| -1.48722268468 | 5.8 |
| -1.50066851273 | 5.606 |
| -1.50283773413 | 5.232 |
| -1.5127982761 | 4.996 |
| -1.51790256906 | 4.982 |
| -1.51970796174 | 6.528 |
| -1.54968702597 | 5.733 |
| -1.56219119306 | 5.701 |
| -1.56393252444 | 7.893 |
| -1.57513301367 | 4.357 |
| -1.58100584403 | 7.859 |
| -1.59209574166 | 6.221 |
| -1.60106217848 | 4.97 |
| -1.6275686721 | 4.859 |
| -1.62778640065 | 4.341 |
| -1.66064506648 | 5.778 |
| -1.66117537106 | 4.205 |
| -1.67351841883 | 4.581 |
| -1.68714556749 | 8.825 |
| -1.69854220771 | 5.678 |
| -1.7048719644600001 | 5.138 |
| -1.71543243262 | 6.639 |
| -1.716207034 | 4.233 |
| -1.73146007302 | 5.94 |
| -1.73413122186 | 5.429 |
| -1.78438080726 | 5.799 |
| -1.78949374013 | 5.59 |
| -1.80968372812 | 4.749 |
| -1.82123923346 | 4.831 |
| -1.83147920567 | 6.578 |
| -1.84130225398 | 4.392 |
| -1.85858975846 | 7.117 |
| -1.89196235408 | 4.622 |
| -1.90515658694 | 4.327 |
| -1.96082940272 | 4.184 |
| -1.99036057634 | 5.453 |
| -2.00299568686 | 6.028 |
| -2.01322715917 | 5.55 |
| -2.08351424761 | 4.64 |
| -2.09715154569 | 4.005 |
| -2.14176147096 | 4.897 |
| -2.14430325214 | 6.734 |
| -2.1510114101 | 6.051 |
| -2.15497465998 | 4.333 |
| -2.2021579376 | 4.256 |
| -2.2657475772 | 12.4 |
| -2.26814360508 | 4.959 |
| -2.27286253581 | 5.777 |
| -2.2783276931 | 4.75 |
| -2.28175589756 | 4.435 |
| -2.29107813023 | 5.35 |
| -2.29647746723 | 5.402 |
| -2.29773862932 | 4.58 |
| -2.30402894768 | 8.516 |
| -2.32296376976 | 5.02 |
| -2.33667468026 | 6.123 |
| -2.34987245261 | 5.235 |
| -2.35170692752 | 4.448 |
| -2.38895057168 | 4.074 |
| -2.41456285047 | 4.527 |
| -2.44861781994 | 7.167 |
| -2.452478858 | 4.697 |
| -2.51102567212 | 4.678 |
| -2.54207999911 | 4.348 |
| -2.61881229723 | 5.589 |
| -2.66580690099 | 4.614 |
| -2.6699214984 | 4.368 |
| -2.67917784234 | 4.532 |
| -2.69324421674 | 4.859 |
| -2.69439067347 | 4.076 |
| -2.75171604553 | 4.215 |
| -2.76872815655 | 6.496 |
| -2.93147623389 | 4.398 |
| -3.13876406996 | 4.075 |
| -3.20347756115 | 4.032 |
| -3.21026627153 | 6.676 |
| -3.38624290837 | 4.915 |
| -3.47923661343 | 4.306 |
| -3.52636784681 | 5.025 |
| -4.0 | 4 |
| -4.2502036565 | 4.25 |
| -4.38681094647 | 4.387 |
| -4.40568532707 | 4.834 |
| -4.47638168757 | 4.476 |
| -4.6340123564 | 4.634 |
| -4.74038793247 | 4.74 |
| -4.8564877795 | 4.856 |
| -4.9015909919 | 4.902 |